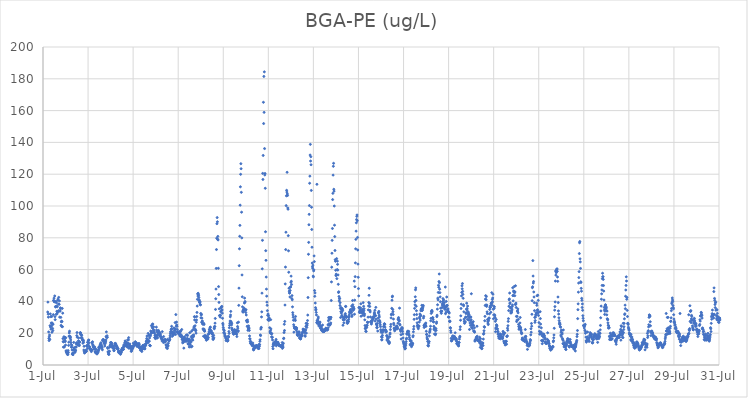
| Category | BGA-PE (ug/L) |
|---|---|
| 44378.208333333336 | 33.31 |
| 44378.21875 | 39.56 |
| 44378.229166666664 | 31.99 |
| 44378.239583333336 | 30.1 |
| 44378.25 | 20.78 |
| 44378.260416666664 | 16.72 |
| 44378.270833333336 | 15.37 |
| 44378.28125 | 17.83 |
| 44378.291666666664 | 18.87 |
| 44378.302083333336 | 16.12 |
| 44378.3125 | 24.76 |
| 44378.322916666664 | 32.16 |
| 44378.333333333336 | 23.87 |
| 44378.34375 | 30.43 |
| 44378.354166666664 | 22.55 |
| 44378.364583333336 | 26.43 |
| 44378.375 | 24.46 |
| 44378.385416666664 | 30.5 |
| 44378.395833333336 | 20.56 |
| 44378.40625 | 26.41 |
| 44378.416666666664 | 25.51 |
| 44378.427083333336 | 22.97 |
| 44378.4375 | 21.65 |
| 44378.447916666664 | 25.65 |
| 44378.458333333336 | 31.68 |
| 44378.46875 | 40.64 |
| 44378.479166666664 | 40.42 |
| 44378.489583333336 | 42.03 |
| 44378.5 | 39.78 |
| 44378.510416666664 | 39.86 |
| 44378.520833333336 | 43.42 |
| 44378.53125 | 30.41 |
| 44378.541666666664 | 28.54 |
| 44378.552083333336 | 36.74 |
| 44378.5625 | 36.49 |
| 44378.572916666664 | 39.96 |
| 44378.583333333336 | 31.83 |
| 44378.59375 | 39.16 |
| 44378.604166666664 | 36.99 |
| 44378.614583333336 | 33.79 |
| 44378.625 | 32.2 |
| 44378.635416666664 | 36.65 |
| 44378.645833333336 | 33.16 |
| 44378.65625 | 40.75 |
| 44378.666666666664 | 41.42 |
| 44378.677083333336 | 34.01 |
| 44378.6875 | 38.34 |
| 44378.697916666664 | 42.54 |
| 44378.708333333336 | 34.14 |
| 44378.71875 | 38.15 |
| 44378.729166666664 | 40.31 |
| 44378.739583333336 | 30.11 |
| 44378.75 | 33.81 |
| 44378.760416666664 | 34.07 |
| 44378.770833333336 | 35.94 |
| 44378.78125 | 35.5 |
| 44378.791666666664 | 29.96 |
| 44378.802083333336 | 24.92 |
| 44378.8125 | 27.16 |
| 44378.822916666664 | 27.53 |
| 44378.833333333336 | 24.17 |
| 44378.84375 | 27.28 |
| 44378.854166666664 | 35.59 |
| 44378.864583333336 | 24.11 |
| 44378.875 | 32.61 |
| 44378.885416666664 | 16.61 |
| 44378.895833333336 | 14.73 |
| 44378.90625 | 11.23 |
| 44378.916666666664 | 14.56 |
| 44378.927083333336 | 17.75 |
| 44378.9375 | 11.4 |
| 44378.947916666664 | 11.41 |
| 44378.958333333336 | 16.57 |
| 44378.96875 | 17.48 |
| 44378.979166666664 | 15.41 |
| 44378.989583333336 | 14.73 |
| 44379.0 | 12.54 |
| 44379.010416666664 | 17.13 |
| 44379.020833333336 | 8.84 |
| 44379.03125 | 8.8 |
| 44379.041666666664 | 7.96 |
| 44379.052083333336 | 7.7 |
| 44379.0625 | 8.77 |
| 44379.072916666664 | 7.37 |
| 44379.083333333336 | 6.65 |
| 44379.09375 | 7.17 |
| 44379.104166666664 | 6.57 |
| 44379.114583333336 | 9.09 |
| 44379.125 | 7.9 |
| 44379.135416666664 | 12.32 |
| 44379.145833333336 | 14.35 |
| 44379.15625 | 18.14 |
| 44379.166666666664 | 20.14 |
| 44379.177083333336 | 21.27 |
| 44379.1875 | 17.79 |
| 44379.197916666664 | 18.1 |
| 44379.208333333336 | 16.87 |
| 44379.21875 | 17.45 |
| 44379.229166666664 | 15.76 |
| 44379.239583333336 | 14.22 |
| 44379.25 | 12.93 |
| 44379.260416666664 | 11.3 |
| 44379.270833333336 | 11.16 |
| 44379.28125 | 12.42 |
| 44379.291666666664 | 9.45 |
| 44379.302083333336 | 6.78 |
| 44379.3125 | 7.08 |
| 44379.322916666664 | 7.58 |
| 44379.333333333336 | 6.47 |
| 44379.34375 | 7.42 |
| 44379.354166666664 | 9.43 |
| 44379.364583333336 | 14.2 |
| 44379.375 | 10.65 |
| 44379.385416666664 | 10.89 |
| 44379.395833333336 | 9.6 |
| 44379.40625 | 9.14 |
| 44379.416666666664 | 7.91 |
| 44379.427083333336 | 8.47 |
| 44379.4375 | 9.06 |
| 44379.447916666664 | 9.3 |
| 44379.458333333336 | 11.19 |
| 44379.46875 | 11.37 |
| 44379.479166666664 | 13.23 |
| 44379.489583333336 | 14.04 |
| 44379.5 | 18.48 |
| 44379.510416666664 | 20.41 |
| 44379.520833333336 | 17.46 |
| 44379.53125 | 13.71 |
| 44379.541666666664 | 13.32 |
| 44379.552083333336 | 12.68 |
| 44379.5625 | 12.41 |
| 44379.572916666664 | 15.25 |
| 44379.583333333336 | 17.06 |
| 44379.59375 | 14.6 |
| 44379.604166666664 | 12.84 |
| 44379.614583333336 | 12.23 |
| 44379.625 | 14.38 |
| 44379.635416666664 | 14.44 |
| 44379.645833333336 | 20.23 |
| 44379.65625 | 20.19 |
| 44379.666666666664 | 20.32 |
| 44379.677083333336 | 19.05 |
| 44379.6875 | 19.18 |
| 44379.697916666664 | 17.1 |
| 44379.708333333336 | 17.31 |
| 44379.71875 | 18.7 |
| 44379.729166666664 | 17.12 |
| 44379.739583333336 | 16.35 |
| 44379.75 | 15.94 |
| 44379.760416666664 | 15.46 |
| 44379.770833333336 | 13.69 |
| 44379.78125 | 15.69 |
| 44379.791666666664 | 15.46 |
| 44379.802083333336 | 14.37 |
| 44379.8125 | 9.44 |
| 44379.822916666664 | 11.75 |
| 44379.833333333336 | 8.46 |
| 44379.84375 | 7.49 |
| 44379.854166666664 | 8.1 |
| 44379.864583333336 | 8.16 |
| 44379.875 | 8.69 |
| 44379.885416666664 | 8.29 |
| 44379.895833333336 | 8.35 |
| 44379.90625 | 9.25 |
| 44379.916666666664 | 8.76 |
| 44379.927083333336 | 8.65 |
| 44379.9375 | 12.15 |
| 44379.947916666664 | 11.9 |
| 44379.958333333336 | 11.86 |
| 44379.96875 | 10.39 |
| 44379.979166666664 | 14.22 |
| 44379.989583333336 | 14.36 |
| 44380.0 | 12.8 |
| 44380.010416666664 | 15.24 |
| 44380.020833333336 | 15.49 |
| 44380.03125 | 15.75 |
| 44380.041666666664 | 13.92 |
| 44380.052083333336 | 11.72 |
| 44380.0625 | 10.47 |
| 44380.072916666664 | 11.26 |
| 44380.083333333336 | 10.14 |
| 44380.09375 | 10.38 |
| 44380.104166666664 | 9.75 |
| 44380.114583333336 | 9.85 |
| 44380.125 | 9.39 |
| 44380.135416666664 | 9.03 |
| 44380.145833333336 | 8.44 |
| 44380.15625 | 9.46 |
| 44380.166666666664 | 13.96 |
| 44380.177083333336 | 9.55 |
| 44380.1875 | 13.89 |
| 44380.197916666664 | 14.64 |
| 44380.208333333336 | 12.78 |
| 44380.21875 | 12.31 |
| 44380.229166666664 | 11.53 |
| 44380.239583333336 | 11.13 |
| 44380.25 | 11.29 |
| 44380.260416666664 | 9.96 |
| 44380.270833333336 | 11.26 |
| 44380.28125 | 10.85 |
| 44380.291666666664 | 11.39 |
| 44380.302083333336 | 10.02 |
| 44380.3125 | 8.28 |
| 44380.322916666664 | 8.46 |
| 44380.333333333336 | 7.66 |
| 44380.34375 | 7.98 |
| 44380.354166666664 | 9.95 |
| 44380.364583333336 | 8 |
| 44380.375 | 7.69 |
| 44380.385416666664 | 7.7 |
| 44380.395833333336 | 6.91 |
| 44380.40625 | 7.71 |
| 44380.416666666664 | 7.51 |
| 44380.427083333336 | 8.96 |
| 44380.4375 | 8.76 |
| 44380.447916666664 | 8.13 |
| 44380.458333333336 | 8.91 |
| 44380.46875 | 11.08 |
| 44380.479166666664 | 9.68 |
| 44380.489583333336 | 10.19 |
| 44380.5 | 11.33 |
| 44380.510416666664 | 11.13 |
| 44380.520833333336 | 11 |
| 44380.53125 | 12.35 |
| 44380.541666666664 | 13.06 |
| 44380.552083333336 | 12.88 |
| 44380.5625 | 12.35 |
| 44380.572916666664 | 14.03 |
| 44380.583333333336 | 12.76 |
| 44380.59375 | 10.98 |
| 44380.604166666664 | 11.9 |
| 44380.614583333336 | 10.61 |
| 44380.625 | 11.01 |
| 44380.635416666664 | 9.57 |
| 44380.645833333336 | 15.63 |
| 44380.65625 | 15.37 |
| 44380.666666666664 | 16 |
| 44380.677083333336 | 15.71 |
| 44380.6875 | 15.95 |
| 44380.697916666664 | 15.39 |
| 44380.708333333336 | 13.82 |
| 44380.71875 | 13.47 |
| 44380.729166666664 | 14.19 |
| 44380.739583333336 | 11.93 |
| 44380.75 | 14.69 |
| 44380.760416666664 | 13.37 |
| 44380.770833333336 | 14.19 |
| 44380.78125 | 14.97 |
| 44380.791666666664 | 15.77 |
| 44380.802083333336 | 17.92 |
| 44380.8125 | 20.83 |
| 44380.822916666664 | 17.36 |
| 44380.833333333336 | 17.69 |
| 44380.84375 | 18.38 |
| 44380.854166666664 | 17.36 |
| 44380.864583333336 | 10.98 |
| 44380.875 | 10.44 |
| 44380.885416666664 | 8.31 |
| 44380.895833333336 | 8.11 |
| 44380.90625 | 6.84 |
| 44380.916666666664 | 7.02 |
| 44380.927083333336 | 6.62 |
| 44380.9375 | 8.44 |
| 44380.947916666664 | 8.7 |
| 44380.958333333336 | 11.17 |
| 44380.96875 | 12.06 |
| 44380.979166666664 | 11.68 |
| 44380.989583333336 | 12.65 |
| 44381.0 | 14.14 |
| 44381.010416666664 | 13.85 |
| 44381.020833333336 | 13.09 |
| 44381.03125 | 13.78 |
| 44381.041666666664 | 14 |
| 44381.052083333336 | 13.01 |
| 44381.0625 | 12.33 |
| 44381.072916666664 | 11.16 |
| 44381.083333333336 | 11.4 |
| 44381.09375 | 11.69 |
| 44381.104166666664 | 11.56 |
| 44381.114583333336 | 10.4 |
| 44381.125 | 10.54 |
| 44381.135416666664 | 10.45 |
| 44381.145833333336 | 8.97 |
| 44381.15625 | 9.19 |
| 44381.166666666664 | 10.31 |
| 44381.177083333336 | 12.05 |
| 44381.1875 | 13.51 |
| 44381.197916666664 | 12.98 |
| 44381.208333333336 | 12.96 |
| 44381.21875 | 13.6 |
| 44381.229166666664 | 12.19 |
| 44381.239583333336 | 12.93 |
| 44381.25 | 11.51 |
| 44381.260416666664 | 11.85 |
| 44381.270833333336 | 10.41 |
| 44381.28125 | 11.74 |
| 44381.291666666664 | 11.14 |
| 44381.302083333336 | 10.34 |
| 44381.3125 | 10.43 |
| 44381.322916666664 | 9.98 |
| 44381.333333333336 | 10.21 |
| 44381.34375 | 8.76 |
| 44381.354166666664 | 8.18 |
| 44381.364583333336 | 7.73 |
| 44381.375 | 8.23 |
| 44381.385416666664 | 8.3 |
| 44381.395833333336 | 8.35 |
| 44381.40625 | 8.23 |
| 44381.416666666664 | 8.58 |
| 44381.427083333336 | 7.86 |
| 44381.4375 | 6.71 |
| 44381.447916666664 | 7.36 |
| 44381.458333333336 | 7.66 |
| 44381.46875 | 8.18 |
| 44381.479166666664 | 8.21 |
| 44381.489583333336 | 9.85 |
| 44381.5 | 9.84 |
| 44381.510416666664 | 9.36 |
| 44381.520833333336 | 9.98 |
| 44381.53125 | 10.78 |
| 44381.541666666664 | 10.82 |
| 44381.552083333336 | 9.72 |
| 44381.5625 | 9.98 |
| 44381.572916666664 | 9.89 |
| 44381.583333333336 | 12.54 |
| 44381.59375 | 12.01 |
| 44381.604166666664 | 11.8 |
| 44381.614583333336 | 11.97 |
| 44381.625 | 13.9 |
| 44381.635416666664 | 11.85 |
| 44381.645833333336 | 15.15 |
| 44381.65625 | 14.6 |
| 44381.666666666664 | 13.25 |
| 44381.677083333336 | 12.46 |
| 44381.6875 | 14.1 |
| 44381.697916666664 | 12.82 |
| 44381.708333333336 | 14.32 |
| 44381.71875 | 13.42 |
| 44381.729166666664 | 12.52 |
| 44381.739583333336 | 11.29 |
| 44381.75 | 11.57 |
| 44381.760416666664 | 15.85 |
| 44381.770833333336 | 13.7 |
| 44381.78125 | 13.38 |
| 44381.791666666664 | 15.79 |
| 44381.802083333336 | 17.22 |
| 44381.8125 | 10.53 |
| 44381.822916666664 | 11.7 |
| 44381.833333333336 | 12.76 |
| 44381.84375 | 11.84 |
| 44381.854166666664 | 13.25 |
| 44381.864583333336 | 11.48 |
| 44381.875 | 10.47 |
| 44381.885416666664 | 11.86 |
| 44381.895833333336 | 11.72 |
| 44381.90625 | 10.54 |
| 44381.916666666664 | 8.56 |
| 44381.927083333336 | 8.87 |
| 44381.9375 | 10.25 |
| 44381.947916666664 | 9.55 |
| 44381.958333333336 | 10.13 |
| 44381.96875 | 10.67 |
| 44381.979166666664 | 10.91 |
| 44381.989583333336 | 11.89 |
| 44382.0 | 10.83 |
| 44382.010416666664 | 13.75 |
| 44382.020833333336 | 12.02 |
| 44382.03125 | 12.49 |
| 44382.041666666664 | 12.47 |
| 44382.052083333336 | 12.8 |
| 44382.0625 | 12.42 |
| 44382.072916666664 | 12.92 |
| 44382.083333333336 | 13.44 |
| 44382.09375 | 14.63 |
| 44382.104166666664 | 14.31 |
| 44382.114583333336 | 12.99 |
| 44382.125 | 13.87 |
| 44382.135416666664 | 13.83 |
| 44382.145833333336 | 12.88 |
| 44382.15625 | 13.04 |
| 44382.166666666664 | 11.73 |
| 44382.177083333336 | 13.45 |
| 44382.1875 | 12.46 |
| 44382.197916666664 | 12.14 |
| 44382.208333333336 | 11.78 |
| 44382.21875 | 12.8 |
| 44382.229166666664 | 11.59 |
| 44382.239583333336 | 13.14 |
| 44382.25 | 12.42 |
| 44382.260416666664 | 13.59 |
| 44382.270833333336 | 12.77 |
| 44382.28125 | 10.78 |
| 44382.291666666664 | 10.82 |
| 44382.302083333336 | 10.68 |
| 44382.3125 | 10.52 |
| 44382.322916666664 | 9.31 |
| 44382.333333333336 | 11.33 |
| 44382.34375 | 10.98 |
| 44382.354166666664 | 10.83 |
| 44382.364583333336 | 10.62 |
| 44382.375 | 9.53 |
| 44382.385416666664 | 8.5 |
| 44382.395833333336 | 9.73 |
| 44382.40625 | 9.97 |
| 44382.416666666664 | 11.46 |
| 44382.427083333336 | 12.21 |
| 44382.4375 | 12.19 |
| 44382.447916666664 | 11.13 |
| 44382.458333333336 | 12.39 |
| 44382.46875 | 10.83 |
| 44382.479166666664 | 10.24 |
| 44382.489583333336 | 10.47 |
| 44382.5 | 10.76 |
| 44382.510416666664 | 10.29 |
| 44382.520833333336 | 10.14 |
| 44382.53125 | 11.8 |
| 44382.541666666664 | 12.5 |
| 44382.552083333336 | 13.33 |
| 44382.5625 | 12.53 |
| 44382.572916666664 | 13.46 |
| 44382.583333333336 | 14.96 |
| 44382.59375 | 14.85 |
| 44382.604166666664 | 16.68 |
| 44382.614583333336 | 18.21 |
| 44382.625 | 15.94 |
| 44382.635416666664 | 15.1 |
| 44382.645833333336 | 15.82 |
| 44382.65625 | 13.91 |
| 44382.666666666664 | 19.85 |
| 44382.677083333336 | 15.1 |
| 44382.6875 | 14.85 |
| 44382.697916666664 | 18.69 |
| 44382.708333333336 | 18.59 |
| 44382.71875 | 14.98 |
| 44382.729166666664 | 17.01 |
| 44382.739583333336 | 12.45 |
| 44382.75 | 12.17 |
| 44382.760416666664 | 12.11 |
| 44382.770833333336 | 18.36 |
| 44382.78125 | 21.34 |
| 44382.791666666664 | 19.68 |
| 44382.802083333336 | 20.81 |
| 44382.8125 | 24.77 |
| 44382.822916666664 | 20.49 |
| 44382.833333333336 | 20.35 |
| 44382.84375 | 23.84 |
| 44382.854166666664 | 25.63 |
| 44382.864583333336 | 23.12 |
| 44382.875 | 25.76 |
| 44382.885416666664 | 23.85 |
| 44382.895833333336 | 21.76 |
| 44382.90625 | 24.02 |
| 44382.916666666664 | 22.08 |
| 44382.927083333336 | 20.73 |
| 44382.9375 | 20.7 |
| 44382.947916666664 | 19.93 |
| 44382.958333333336 | 17.23 |
| 44382.96875 | 18.66 |
| 44382.979166666664 | 17.16 |
| 44382.989583333336 | 16.58 |
| 44383.0 | 18.44 |
| 44383.010416666664 | 18.06 |
| 44383.020833333336 | 18.4 |
| 44383.03125 | 23.84 |
| 44383.041666666664 | 21.95 |
| 44383.052083333336 | 16.93 |
| 44383.0625 | 20.88 |
| 44383.072916666664 | 18.88 |
| 44383.083333333336 | 17.09 |
| 44383.09375 | 18.55 |
| 44383.104166666664 | 20.15 |
| 44383.114583333336 | 19.97 |
| 44383.125 | 21.74 |
| 44383.135416666664 | 20.21 |
| 44383.145833333336 | 20.47 |
| 44383.15625 | 20.87 |
| 44383.166666666664 | 20.33 |
| 44383.177083333336 | 19.2 |
| 44383.1875 | 18.26 |
| 44383.197916666664 | 19.22 |
| 44383.208333333336 | 19.63 |
| 44383.21875 | 17.83 |
| 44383.229166666664 | 17.82 |
| 44383.239583333336 | 17.85 |
| 44383.25 | 16.56 |
| 44383.260416666664 | 16.67 |
| 44383.270833333336 | 17.06 |
| 44383.28125 | 15.15 |
| 44383.291666666664 | 20.98 |
| 44383.302083333336 | 16.02 |
| 44383.3125 | 15.8 |
| 44383.322916666664 | 15.77 |
| 44383.333333333336 | 15.55 |
| 44383.34375 | 14.15 |
| 44383.354166666664 | 17.89 |
| 44383.364583333336 | 15.46 |
| 44383.375 | 15.72 |
| 44383.385416666664 | 15.35 |
| 44383.395833333336 | 14.45 |
| 44383.40625 | 15.93 |
| 44383.416666666664 | 15.05 |
| 44383.427083333336 | 16.06 |
| 44383.4375 | 14.68 |
| 44383.447916666664 | 15.74 |
| 44383.458333333336 | 12.6 |
| 44383.46875 | 12.68 |
| 44383.479166666664 | 11.17 |
| 44383.489583333336 | 10.75 |
| 44383.5 | 12.13 |
| 44383.510416666664 | 11.34 |
| 44383.520833333336 | 10.38 |
| 44383.53125 | 16.17 |
| 44383.541666666664 | 12.38 |
| 44383.552083333336 | 11.95 |
| 44383.5625 | 13.71 |
| 44383.572916666664 | 15.39 |
| 44383.583333333336 | 15.53 |
| 44383.59375 | 15.2 |
| 44383.604166666664 | 15.34 |
| 44383.614583333336 | 15.81 |
| 44383.625 | 16.13 |
| 44383.635416666664 | 17.37 |
| 44383.645833333336 | 18.61 |
| 44383.65625 | 19.86 |
| 44383.666666666664 | 21.02 |
| 44383.677083333336 | 20.63 |
| 44383.6875 | 22.21 |
| 44383.697916666664 | 22.72 |
| 44383.708333333336 | 24.34 |
| 44383.71875 | 22.74 |
| 44383.729166666664 | 19.71 |
| 44383.739583333336 | 18.06 |
| 44383.75 | 20.78 |
| 44383.760416666664 | 20.32 |
| 44383.770833333336 | 19.18 |
| 44383.78125 | 18.87 |
| 44383.791666666664 | 20.1 |
| 44383.802083333336 | 19.22 |
| 44383.8125 | 23.34 |
| 44383.822916666664 | 20.13 |
| 44383.833333333336 | 21.67 |
| 44383.84375 | 22.67 |
| 44383.854166666664 | 22.05 |
| 44383.864583333336 | 26.67 |
| 44383.875 | 22.69 |
| 44383.885416666664 | 19.2 |
| 44383.895833333336 | 31.71 |
| 44383.90625 | 20.83 |
| 44383.916666666664 | 24.51 |
| 44383.927083333336 | 26.99 |
| 44383.9375 | 25.24 |
| 44383.947916666664 | 24.3 |
| 44383.958333333336 | 22.35 |
| 44383.96875 | 20.83 |
| 44383.979166666664 | 20.34 |
| 44383.989583333336 | 20.41 |
| 44384.0 | 20.22 |
| 44384.010416666664 | 19.86 |
| 44384.020833333336 | 19.72 |
| 44384.03125 | 20.2 |
| 44384.041666666664 | 21.05 |
| 44384.052083333336 | 20.48 |
| 44384.0625 | 20.34 |
| 44384.072916666664 | 18.42 |
| 44384.083333333336 | 18.25 |
| 44384.09375 | 19.18 |
| 44384.104166666664 | 21.08 |
| 44384.114583333336 | 21.44 |
| 44384.125 | 18.86 |
| 44384.135416666664 | 18.76 |
| 44384.145833333336 | 17.44 |
| 44384.15625 | 22.31 |
| 44384.166666666664 | 18.05 |
| 44384.177083333336 | 16.05 |
| 44384.1875 | 16.28 |
| 44384.197916666664 | 13.95 |
| 44384.208333333336 | 15.1 |
| 44384.21875 | 14.97 |
| 44384.229166666664 | 16.55 |
| 44384.239583333336 | 14.32 |
| 44384.25 | 10.62 |
| 44384.260416666664 | 15.84 |
| 44384.270833333336 | 17.69 |
| 44384.28125 | 17.38 |
| 44384.291666666664 | 15.74 |
| 44384.302083333336 | 16.04 |
| 44384.3125 | 15.57 |
| 44384.322916666664 | 14.92 |
| 44384.333333333336 | 15.46 |
| 44384.34375 | 15.3 |
| 44384.354166666664 | 18.77 |
| 44384.364583333336 | 16.44 |
| 44384.375 | 16.1 |
| 44384.385416666664 | 14.86 |
| 44384.395833333336 | 19 |
| 44384.40625 | 16.61 |
| 44384.416666666664 | 18.53 |
| 44384.427083333336 | 16.46 |
| 44384.4375 | 13.26 |
| 44384.447916666664 | 13.29 |
| 44384.458333333336 | 13.05 |
| 44384.46875 | 15.39 |
| 44384.479166666664 | 14.54 |
| 44384.489583333336 | 11.35 |
| 44384.5 | 16.21 |
| 44384.510416666664 | 20.28 |
| 44384.520833333336 | 13.18 |
| 44384.53125 | 12.74 |
| 44384.541666666664 | 15.01 |
| 44384.552083333336 | 14.88 |
| 44384.5625 | 14.34 |
| 44384.572916666664 | 11.35 |
| 44384.583333333336 | 17.89 |
| 44384.59375 | 21.27 |
| 44384.604166666664 | 17.23 |
| 44384.614583333336 | 11.73 |
| 44384.625 | 16.25 |
| 44384.635416666664 | 18.53 |
| 44384.645833333336 | 15.61 |
| 44384.65625 | 22.2 |
| 44384.666666666664 | 17.65 |
| 44384.677083333336 | 18.08 |
| 44384.6875 | 18.88 |
| 44384.697916666664 | 23.41 |
| 44384.708333333336 | 24.23 |
| 44384.71875 | 30.41 |
| 44384.729166666664 | 28.32 |
| 44384.739583333336 | 30.24 |
| 44384.75 | 24.7 |
| 44384.760416666664 | 22.48 |
| 44384.770833333336 | 21.56 |
| 44384.78125 | 21.74 |
| 44384.791666666664 | 20.03 |
| 44384.802083333336 | 26.92 |
| 44384.8125 | 28.34 |
| 44384.822916666664 | 30.5 |
| 44384.833333333336 | 33.07 |
| 44384.84375 | 37.06 |
| 44384.854166666664 | 41.29 |
| 44384.864583333336 | 44.73 |
| 44384.875 | 43.37 |
| 44384.885416666664 | 45.1 |
| 44384.895833333336 | 44.44 |
| 44384.90625 | 43.63 |
| 44384.916666666664 | 42.42 |
| 44384.927083333336 | 40.31 |
| 44384.9375 | 40.87 |
| 44384.947916666664 | 39.32 |
| 44384.958333333336 | 39.23 |
| 44384.96875 | 39.83 |
| 44384.979166666664 | 38.04 |
| 44384.989583333336 | 37.8 |
| 44385.0 | 32.39 |
| 44385.010416666664 | 29.69 |
| 44385.020833333336 | 31.41 |
| 44385.03125 | 31.87 |
| 44385.041666666664 | 26.79 |
| 44385.052083333336 | 29.49 |
| 44385.0625 | 27.43 |
| 44385.072916666664 | 27.67 |
| 44385.083333333336 | 25.83 |
| 44385.09375 | 25.76 |
| 44385.104166666664 | 22.76 |
| 44385.114583333336 | 22.2 |
| 44385.125 | 18.05 |
| 44385.135416666664 | 26.17 |
| 44385.145833333336 | 25.48 |
| 44385.15625 | 22.44 |
| 44385.166666666664 | 21.29 |
| 44385.177083333336 | 21.35 |
| 44385.1875 | 18.6 |
| 44385.197916666664 | 17.13 |
| 44385.208333333336 | 18.19 |
| 44385.21875 | 17.31 |
| 44385.229166666664 | 17.09 |
| 44385.239583333336 | 16.4 |
| 44385.25 | 15.56 |
| 44385.260416666664 | 17.39 |
| 44385.270833333336 | 18.32 |
| 44385.28125 | 16.43 |
| 44385.291666666664 | 17.2 |
| 44385.302083333336 | 17.08 |
| 44385.3125 | 16.23 |
| 44385.322916666664 | 16.94 |
| 44385.333333333336 | 17.36 |
| 44385.34375 | 19.26 |
| 44385.354166666664 | 19.54 |
| 44385.364583333336 | 20.06 |
| 44385.375 | 21.09 |
| 44385.385416666664 | 22.24 |
| 44385.395833333336 | 22.46 |
| 44385.40625 | 22.63 |
| 44385.416666666664 | 23.61 |
| 44385.427083333336 | 23.85 |
| 44385.4375 | 20.98 |
| 44385.447916666664 | 21.26 |
| 44385.458333333336 | 21.65 |
| 44385.46875 | 21.31 |
| 44385.479166666664 | 20.05 |
| 44385.489583333336 | 19.97 |
| 44385.5 | 19.54 |
| 44385.510416666664 | 19.44 |
| 44385.520833333336 | 20.16 |
| 44385.53125 | 17.82 |
| 44385.541666666664 | 16.42 |
| 44385.552083333336 | 16.06 |
| 44385.5625 | 16.67 |
| 44385.572916666664 | 18.66 |
| 44385.583333333336 | 17.07 |
| 44385.59375 | 23.24 |
| 44385.604166666664 | 22.8 |
| 44385.614583333336 | 24.25 |
| 44385.625 | 24.15 |
| 44385.635416666664 | 26.31 |
| 44385.645833333336 | 29.28 |
| 44385.65625 | 34.96 |
| 44385.666666666664 | 41.65 |
| 44385.677083333336 | 47.75 |
| 44385.6875 | 60.75 |
| 44385.697916666664 | 72.6 |
| 44385.708333333336 | 79.74 |
| 44385.71875 | 88.86 |
| 44385.729166666664 | 92.72 |
| 44385.739583333336 | 90.1 |
| 44385.75 | 79.07 |
| 44385.760416666664 | 80.88 |
| 44385.770833333336 | 78.66 |
| 44385.78125 | 60.84 |
| 44385.791666666664 | 49.3 |
| 44385.802083333336 | 44.32 |
| 44385.8125 | 39.36 |
| 44385.822916666664 | 35.33 |
| 44385.833333333336 | 31.02 |
| 44385.84375 | 31.21 |
| 44385.854166666664 | 31.24 |
| 44385.864583333336 | 30.16 |
| 44385.875 | 31.31 |
| 44385.885416666664 | 33.51 |
| 44385.895833333336 | 35.82 |
| 44385.90625 | 36.41 |
| 44385.916666666664 | 36.32 |
| 44385.927083333336 | 34.34 |
| 44385.9375 | 36.89 |
| 44385.947916666664 | 34.65 |
| 44385.958333333336 | 32.61 |
| 44385.96875 | 29.38 |
| 44385.979166666664 | 26.17 |
| 44385.989583333336 | 25.21 |
| 44386.0 | 23.66 |
| 44386.010416666664 | 22.44 |
| 44386.020833333336 | 20.27 |
| 44386.03125 | 21.96 |
| 44386.041666666664 | 21.51 |
| 44386.052083333336 | 19.98 |
| 44386.0625 | 19.6 |
| 44386.072916666664 | 18.57 |
| 44386.083333333336 | 17.88 |
| 44386.09375 | 17.96 |
| 44386.104166666664 | 17.84 |
| 44386.114583333336 | 16.58 |
| 44386.125 | 15.32 |
| 44386.135416666664 | 16.58 |
| 44386.145833333336 | 16.34 |
| 44386.15625 | 16.54 |
| 44386.166666666664 | 16.08 |
| 44386.177083333336 | 15.21 |
| 44386.1875 | 15.06 |
| 44386.197916666664 | 16.21 |
| 44386.208333333336 | 15.32 |
| 44386.21875 | 17.91 |
| 44386.229166666664 | 18.04 |
| 44386.239583333336 | 17.62 |
| 44386.25 | 21.06 |
| 44386.260416666664 | 19.86 |
| 44386.270833333336 | 23.44 |
| 44386.28125 | 24.9 |
| 44386.291666666664 | 26.27 |
| 44386.302083333336 | 27.66 |
| 44386.3125 | 30.31 |
| 44386.322916666664 | 31.43 |
| 44386.333333333336 | 33.71 |
| 44386.34375 | 27.34 |
| 44386.354166666664 | 26.68 |
| 44386.364583333336 | 25.2 |
| 44386.375 | 26.15 |
| 44386.385416666664 | 23.17 |
| 44386.395833333336 | 22.19 |
| 44386.40625 | 22.3 |
| 44386.416666666664 | 21.79 |
| 44386.427083333336 | 20.44 |
| 44386.4375 | 21.29 |
| 44386.447916666664 | 19.98 |
| 44386.458333333336 | 19.39 |
| 44386.46875 | 19.47 |
| 44386.479166666664 | 19.75 |
| 44386.489583333336 | 20.5 |
| 44386.5 | 22 |
| 44386.510416666664 | 22.18 |
| 44386.520833333336 | 20.7 |
| 44386.53125 | 21.26 |
| 44386.541666666664 | 19.88 |
| 44386.552083333336 | 20.37 |
| 44386.5625 | 20.17 |
| 44386.572916666664 | 19.71 |
| 44386.583333333336 | 21.78 |
| 44386.59375 | 19.38 |
| 44386.604166666664 | 17.92 |
| 44386.614583333336 | 21.62 |
| 44386.625 | 26.52 |
| 44386.635416666664 | 24.22 |
| 44386.645833333336 | 23.18 |
| 44386.65625 | 21.06 |
| 44386.666666666664 | 21.54 |
| 44386.677083333336 | 26.93 |
| 44386.6875 | 37.51 |
| 44386.697916666664 | 48.34 |
| 44386.708333333336 | 62.47 |
| 44386.71875 | 73.07 |
| 44386.729166666664 | 80.95 |
| 44386.739583333336 | 87.81 |
| 44386.75 | 100.52 |
| 44386.760416666664 | 112.07 |
| 44386.770833333336 | 119.94 |
| 44386.78125 | 126.6 |
| 44386.791666666664 | 123.45 |
| 44386.802083333336 | 108.6 |
| 44386.8125 | 96.11 |
| 44386.822916666664 | 79.95 |
| 44386.833333333336 | 56.63 |
| 44386.84375 | 42.87 |
| 44386.854166666664 | 36.58 |
| 44386.864583333336 | 33.48 |
| 44386.875 | 34.38 |
| 44386.885416666664 | 33.27 |
| 44386.895833333336 | 33.73 |
| 44386.90625 | 35.17 |
| 44386.916666666664 | 34.85 |
| 44386.927083333336 | 35.72 |
| 44386.9375 | 38.97 |
| 44386.947916666664 | 42.06 |
| 44386.958333333336 | 39.45 |
| 44386.96875 | 39.91 |
| 44386.979166666664 | 34.62 |
| 44386.989583333336 | 34.68 |
| 44387.0 | 33.03 |
| 44387.010416666664 | 34.79 |
| 44387.020833333336 | 31.46 |
| 44387.03125 | 27.9 |
| 44387.041666666664 | 27.98 |
| 44387.052083333336 | 27.09 |
| 44387.0625 | 24.38 |
| 44387.072916666664 | 28.32 |
| 44387.083333333336 | 27.17 |
| 44387.09375 | 21.81 |
| 44387.104166666664 | 23.58 |
| 44387.114583333336 | 22.76 |
| 44387.125 | 24.58 |
| 44387.135416666664 | 23.17 |
| 44387.145833333336 | 23.24 |
| 44387.15625 | 21.74 |
| 44387.166666666664 | 18.27 |
| 44387.177083333336 | 16.53 |
| 44387.1875 | 16.34 |
| 44387.197916666664 | 14.75 |
| 44387.208333333336 | 13.66 |
| 44387.21875 | 14.77 |
| 44387.229166666664 | 13.64 |
| 44387.239583333336 | 13.2 |
| 44387.25 | 13.39 |
| 44387.260416666664 | 13.2 |
| 44387.270833333336 | 12.91 |
| 44387.28125 | 12.15 |
| 44387.291666666664 | 12.54 |
| 44387.302083333336 | 12.76 |
| 44387.3125 | 13.82 |
| 44387.322916666664 | 12.45 |
| 44387.333333333336 | 10.02 |
| 44387.34375 | 9.46 |
| 44387.354166666664 | 9.76 |
| 44387.364583333336 | 10.69 |
| 44387.375 | 11.05 |
| 44387.385416666664 | 11.22 |
| 44387.395833333336 | 11.87 |
| 44387.40625 | 11.79 |
| 44387.416666666664 | 11.38 |
| 44387.427083333336 | 10.89 |
| 44387.4375 | 11.19 |
| 44387.447916666664 | 12.15 |
| 44387.458333333336 | 11.5 |
| 44387.46875 | 12.14 |
| 44387.479166666664 | 11.49 |
| 44387.489583333336 | 12.17 |
| 44387.5 | 12.02 |
| 44387.510416666664 | 11.85 |
| 44387.520833333336 | 11.71 |
| 44387.53125 | 11.57 |
| 44387.541666666664 | 11.26 |
| 44387.552083333336 | 10.39 |
| 44387.5625 | 10.43 |
| 44387.572916666664 | 10.73 |
| 44387.583333333336 | 10.38 |
| 44387.59375 | 13.08 |
| 44387.604166666664 | 11.73 |
| 44387.614583333336 | 12.77 |
| 44387.625 | 14.86 |
| 44387.635416666664 | 15.9 |
| 44387.645833333336 | 18.88 |
| 44387.65625 | 18.49 |
| 44387.666666666664 | 22.57 |
| 44387.677083333336 | 23.26 |
| 44387.6875 | 23.68 |
| 44387.697916666664 | 30.23 |
| 44387.708333333336 | 33.42 |
| 44387.71875 | 45.19 |
| 44387.729166666664 | 60.47 |
| 44387.739583333336 | 78.4 |
| 44387.75 | 120.51 |
| 44387.760416666664 | 116.7 |
| 44387.770833333336 | 131.79 |
| 44387.78125 | 165.22 |
| 44387.791666666664 | 151.86 |
| 44387.802083333336 | 181.49 |
| 44387.8125 | 158.9 |
| 44387.822916666664 | 184.36 |
| 44387.833333333336 | 136.11 |
| 44387.84375 | 119.52 |
| 44387.854166666664 | 120.44 |
| 44387.864583333336 | 111.14 |
| 44387.875 | 83.8 |
| 44387.885416666664 | 71.9 |
| 44387.895833333336 | 65.84 |
| 44387.90625 | 55.31 |
| 44387.916666666664 | 47.72 |
| 44387.927083333336 | 43.31 |
| 44387.9375 | 39.55 |
| 44387.947916666664 | 37.54 |
| 44387.958333333336 | 34.19 |
| 44387.96875 | 31.23 |
| 44387.979166666664 | 28.46 |
| 44387.989583333336 | 32.08 |
| 44388.0 | 28.67 |
| 44388.010416666664 | 31.1 |
| 44388.020833333336 | 28.04 |
| 44388.03125 | 29.75 |
| 44388.041666666664 | 28.43 |
| 44388.052083333336 | 28.75 |
| 44388.0625 | 23.43 |
| 44388.072916666664 | 20.79 |
| 44388.083333333336 | 20.1 |
| 44388.09375 | 21.54 |
| 44388.104166666664 | 28.51 |
| 44388.114583333336 | 22.68 |
| 44388.125 | 19.97 |
| 44388.135416666664 | 19.65 |
| 44388.145833333336 | 17.76 |
| 44388.15625 | 19.73 |
| 44388.166666666664 | 17.34 |
| 44388.177083333336 | 17.5 |
| 44388.1875 | 15.75 |
| 44388.197916666664 | 11.66 |
| 44388.208333333336 | 10.24 |
| 44388.21875 | 13.04 |
| 44388.229166666664 | 13.75 |
| 44388.239583333336 | 12.96 |
| 44388.25 | 12.52 |
| 44388.260416666664 | 13.81 |
| 44388.270833333336 | 13.39 |
| 44388.28125 | 14.48 |
| 44388.291666666664 | 14.22 |
| 44388.302083333336 | 13.74 |
| 44388.3125 | 14.5 |
| 44388.322916666664 | 14.7 |
| 44388.333333333336 | 14.79 |
| 44388.34375 | 16.08 |
| 44388.354166666664 | 12.09 |
| 44388.364583333336 | 12.65 |
| 44388.375 | 14.54 |
| 44388.385416666664 | 13.26 |
| 44388.395833333336 | 13.04 |
| 44388.40625 | 12.96 |
| 44388.416666666664 | 13.9 |
| 44388.427083333336 | 14.31 |
| 44388.4375 | 13.7 |
| 44388.447916666664 | 13.21 |
| 44388.458333333336 | 12.81 |
| 44388.46875 | 12.64 |
| 44388.479166666664 | 12.13 |
| 44388.489583333336 | 12.47 |
| 44388.5 | 12.3 |
| 44388.510416666664 | 12.27 |
| 44388.520833333336 | 11.97 |
| 44388.53125 | 11.97 |
| 44388.541666666664 | 11.81 |
| 44388.552083333336 | 11.85 |
| 44388.5625 | 12.23 |
| 44388.572916666664 | 11.73 |
| 44388.583333333336 | 11.73 |
| 44388.59375 | 12.25 |
| 44388.604166666664 | 11.78 |
| 44388.614583333336 | 14.1 |
| 44388.625 | 10.45 |
| 44388.635416666664 | 11.51 |
| 44388.645833333336 | 12.58 |
| 44388.65625 | 11.21 |
| 44388.666666666664 | 13.68 |
| 44388.677083333336 | 16.59 |
| 44388.6875 | 16.88 |
| 44388.697916666664 | 20.41 |
| 44388.708333333336 | 25.61 |
| 44388.71875 | 21.7 |
| 44388.729166666664 | 27.4 |
| 44388.739583333336 | 37.71 |
| 44388.75 | 50.99 |
| 44388.760416666664 | 61.59 |
| 44388.770833333336 | 72.59 |
| 44388.78125 | 83.52 |
| 44388.791666666664 | 100.25 |
| 44388.802083333336 | 106.4 |
| 44388.8125 | 109.87 |
| 44388.822916666664 | 108.77 |
| 44388.833333333336 | 121.2 |
| 44388.84375 | 107.59 |
| 44388.854166666664 | 106.62 |
| 44388.864583333336 | 98.8 |
| 44388.875 | 97.99 |
| 44388.885416666664 | 81.34 |
| 44388.895833333336 | 71.81 |
| 44388.90625 | 58.34 |
| 44388.916666666664 | 48.29 |
| 44388.927083333336 | 46.45 |
| 44388.9375 | 45.26 |
| 44388.947916666664 | 45.32 |
| 44388.958333333336 | 42.79 |
| 44388.96875 | 46.86 |
| 44388.979166666664 | 49.19 |
| 44388.989583333336 | 49.02 |
| 44389.0 | 52.02 |
| 44389.010416666664 | 55.89 |
| 44389.020833333336 | 52.65 |
| 44389.03125 | 50.63 |
| 44389.041666666664 | 41.79 |
| 44389.052083333336 | 43.64 |
| 44389.0625 | 41 |
| 44389.072916666664 | 36.57 |
| 44389.083333333336 | 32.92 |
| 44389.09375 | 31.51 |
| 44389.104166666664 | 30.03 |
| 44389.114583333336 | 28.16 |
| 44389.125 | 25.31 |
| 44389.135416666664 | 20.65 |
| 44389.145833333336 | 24.16 |
| 44389.15625 | 23.26 |
| 44389.166666666664 | 23 |
| 44389.177083333336 | 23.66 |
| 44389.1875 | 28.87 |
| 44389.197916666664 | 27.98 |
| 44389.208333333336 | 30.53 |
| 44389.21875 | 23.43 |
| 44389.229166666664 | 23.47 |
| 44389.239583333336 | 21.94 |
| 44389.25 | 23.4 |
| 44389.260416666664 | 22.65 |
| 44389.270833333336 | 20.82 |
| 44389.28125 | 19.4 |
| 44389.291666666664 | 18.84 |
| 44389.302083333336 | 18.94 |
| 44389.3125 | 18.49 |
| 44389.322916666664 | 19.15 |
| 44389.333333333336 | 20.34 |
| 44389.34375 | 19.98 |
| 44389.354166666664 | 20.73 |
| 44389.364583333336 | 20.86 |
| 44389.375 | 20.25 |
| 44389.385416666664 | 16.85 |
| 44389.395833333336 | 17.41 |
| 44389.40625 | 19.04 |
| 44389.416666666664 | 17.05 |
| 44389.427083333336 | 16.41 |
| 44389.4375 | 16.46 |
| 44389.447916666664 | 18.3 |
| 44389.458333333336 | 18.66 |
| 44389.46875 | 18.12 |
| 44389.479166666664 | 18.2 |
| 44389.489583333336 | 19.31 |
| 44389.5 | 18.3 |
| 44389.510416666664 | 20.06 |
| 44389.520833333336 | 20.5 |
| 44389.53125 | 21.06 |
| 44389.541666666664 | 22.62 |
| 44389.552083333336 | 22.16 |
| 44389.5625 | 21.46 |
| 44389.572916666664 | 22.24 |
| 44389.583333333336 | 21.73 |
| 44389.59375 | 22.12 |
| 44389.604166666664 | 21.13 |
| 44389.614583333336 | 20.4 |
| 44389.625 | 18.54 |
| 44389.635416666664 | 18.04 |
| 44389.645833333336 | 21.66 |
| 44389.65625 | 22.23 |
| 44389.666666666664 | 24.3 |
| 44389.677083333336 | 26.22 |
| 44389.6875 | 20.07 |
| 44389.697916666664 | 26.01 |
| 44389.708333333336 | 23.64 |
| 44389.71875 | 25 |
| 44389.729166666664 | 25.98 |
| 44389.739583333336 | 27.96 |
| 44389.75 | 31.4 |
| 44389.760416666664 | 42.46 |
| 44389.770833333336 | 54.91 |
| 44389.78125 | 69.63 |
| 44389.791666666664 | 77.11 |
| 44389.802083333336 | 88.21 |
| 44389.8125 | 94.75 |
| 44389.822916666664 | 100.27 |
| 44389.833333333336 | 114.3 |
| 44389.84375 | 118.78 |
| 44389.854166666664 | 132.06 |
| 44389.864583333336 | 138.77 |
| 44389.875 | 128.28 |
| 44389.885416666664 | 131 |
| 44389.895833333336 | 125.94 |
| 44389.90625 | 109.79 |
| 44389.916666666664 | 99.22 |
| 44389.927083333336 | 85.23 |
| 44389.9375 | 74.08 |
| 44389.947916666664 | 64.13 |
| 44389.958333333336 | 61.8 |
| 44389.96875 | 60.85 |
| 44389.979166666664 | 62.8 |
| 44389.989583333336 | 55.93 |
| 44390.0 | 55.43 |
| 44390.010416666664 | 59.19 |
| 44390.020833333336 | 59.83 |
| 44390.03125 | 68.6 |
| 44390.041666666664 | 65.03 |
| 44390.052083333336 | 46.82 |
| 44390.0625 | 43.19 |
| 44390.072916666664 | 45.32 |
| 44390.083333333336 | 38.96 |
| 44390.09375 | 36.09 |
| 44390.104166666664 | 34.55 |
| 44390.114583333336 | 35 |
| 44390.125 | 33.08 |
| 44390.135416666664 | 31.47 |
| 44390.145833333336 | 26.76 |
| 44390.15625 | 113.64 |
| 44390.166666666664 | 27.89 |
| 44390.177083333336 | 26.1 |
| 44390.1875 | 28.24 |
| 44390.197916666664 | 27.31 |
| 44390.208333333336 | 29.12 |
| 44390.21875 | 30.15 |
| 44390.229166666664 | 26.19 |
| 44390.239583333336 | 24.6 |
| 44390.25 | 26.58 |
| 44390.260416666664 | 26.04 |
| 44390.270833333336 | 25.26 |
| 44390.28125 | 26.6 |
| 44390.291666666664 | 27.03 |
| 44390.302083333336 | 24.66 |
| 44390.3125 | 23.49 |
| 44390.322916666664 | 23.01 |
| 44390.333333333336 | 22.9 |
| 44390.34375 | 24.17 |
| 44390.354166666664 | 23.72 |
| 44390.364583333336 | 21.88 |
| 44390.375 | 21.67 |
| 44390.385416666664 | 22.19 |
| 44390.395833333336 | 21.89 |
| 44390.40625 | 25.12 |
| 44390.416666666664 | 22.29 |
| 44390.427083333336 | 20.87 |
| 44390.4375 | 21.41 |
| 44390.447916666664 | 21.96 |
| 44390.458333333336 | 21.08 |
| 44390.46875 | 21.09 |
| 44390.479166666664 | 21.31 |
| 44390.489583333336 | 21.38 |
| 44390.5 | 21.49 |
| 44390.510416666664 | 21.52 |
| 44390.520833333336 | 21.83 |
| 44390.53125 | 22.5 |
| 44390.541666666664 | 22.6 |
| 44390.552083333336 | 23.19 |
| 44390.5625 | 22.67 |
| 44390.572916666664 | 22.66 |
| 44390.583333333336 | 21.98 |
| 44390.59375 | 22.41 |
| 44390.604166666664 | 22.35 |
| 44390.614583333336 | 22.1 |
| 44390.625 | 22.11 |
| 44390.635416666664 | 22.44 |
| 44390.645833333336 | 25.23 |
| 44390.65625 | 23.42 |
| 44390.666666666664 | 27.8 |
| 44390.677083333336 | 29.85 |
| 44390.6875 | 25.88 |
| 44390.697916666664 | 28.72 |
| 44390.708333333336 | 29.34 |
| 44390.71875 | 24.94 |
| 44390.729166666664 | 29.94 |
| 44390.739583333336 | 25.35 |
| 44390.75 | 25.7 |
| 44390.760416666664 | 28.96 |
| 44390.770833333336 | 26.46 |
| 44390.78125 | 30 |
| 44390.791666666664 | 40.58 |
| 44390.802083333336 | 52.26 |
| 44390.8125 | 61.52 |
| 44390.822916666664 | 70.29 |
| 44390.833333333336 | 78.38 |
| 44390.84375 | 85.86 |
| 44390.854166666664 | 104.05 |
| 44390.864583333336 | 107.97 |
| 44390.875 | 119.43 |
| 44390.885416666664 | 124.97 |
| 44390.895833333336 | 126.84 |
| 44390.90625 | 110.52 |
| 44390.916666666664 | 109.34 |
| 44390.927083333336 | 99.99 |
| 44390.9375 | 87.93 |
| 44390.947916666664 | 80.76 |
| 44390.958333333336 | 72.02 |
| 44390.96875 | 66.26 |
| 44390.979166666664 | 65.24 |
| 44390.989583333336 | 59.59 |
| 44391.0 | 56.24 |
| 44391.010416666664 | 57.11 |
| 44391.020833333336 | 56.59 |
| 44391.03125 | 66.91 |
| 44391.041666666664 | 54.33 |
| 44391.052083333336 | 59.99 |
| 44391.0625 | 65.31 |
| 44391.072916666664 | 63.3 |
| 44391.083333333336 | 59.7 |
| 44391.09375 | 56.65 |
| 44391.104166666664 | 50.74 |
| 44391.114583333336 | 45.59 |
| 44391.125 | 46.04 |
| 44391.135416666664 | 43.08 |
| 44391.145833333336 | 40.35 |
| 44391.15625 | 41.66 |
| 44391.166666666664 | 41.93 |
| 44391.177083333336 | 37.42 |
| 44391.1875 | 39.17 |
| 44391.197916666664 | 35.58 |
| 44391.208333333336 | 29.87 |
| 44391.21875 | 33.55 |
| 44391.229166666664 | 36.12 |
| 44391.239583333336 | 32.61 |
| 44391.25 | 34.97 |
| 44391.260416666664 | 31.22 |
| 44391.270833333336 | 33.58 |
| 44391.28125 | 35.48 |
| 44391.291666666664 | 30.23 |
| 44391.302083333336 | 34.51 |
| 44391.3125 | 25 |
| 44391.322916666664 | 28.51 |
| 44391.333333333336 | 28.44 |
| 44391.34375 | 29.61 |
| 44391.354166666664 | 26.57 |
| 44391.364583333336 | 28.88 |
| 44391.375 | 28.63 |
| 44391.385416666664 | 30.03 |
| 44391.395833333336 | 31.45 |
| 44391.40625 | 30.65 |
| 44391.416666666664 | 32.32 |
| 44391.427083333336 | 36.85 |
| 44391.4375 | 36.83 |
| 44391.447916666664 | 30.95 |
| 44391.458333333336 | 29.93 |
| 44391.46875 | 30.1 |
| 44391.479166666664 | 30.25 |
| 44391.489583333336 | 27.79 |
| 44391.5 | 26.26 |
| 44391.510416666664 | 26.8 |
| 44391.520833333336 | 26.31 |
| 44391.53125 | 26.99 |
| 44391.541666666664 | 27.31 |
| 44391.552083333336 | 27.23 |
| 44391.5625 | 28.51 |
| 44391.572916666664 | 29.83 |
| 44391.583333333336 | 30.45 |
| 44391.59375 | 31.46 |
| 44391.604166666664 | 33.36 |
| 44391.614583333336 | 32.59 |
| 44391.625 | 33.15 |
| 44391.635416666664 | 34.52 |
| 44391.645833333336 | 34.86 |
| 44391.65625 | 33.65 |
| 44391.666666666664 | 33.61 |
| 44391.677083333336 | 33.47 |
| 44391.6875 | 32.96 |
| 44391.697916666664 | 37.06 |
| 44391.708333333336 | 30.52 |
| 44391.71875 | 31.35 |
| 44391.729166666664 | 35.62 |
| 44391.739583333336 | 40.57 |
| 44391.75 | 37.89 |
| 44391.760416666664 | 34.99 |
| 44391.770833333336 | 34.4 |
| 44391.78125 | 36.44 |
| 44391.791666666664 | 35.17 |
| 44391.802083333336 | 35.36 |
| 44391.8125 | 52.77 |
| 44391.822916666664 | 31.94 |
| 44391.833333333336 | 40.77 |
| 44391.84375 | 49.25 |
| 44391.854166666664 | 55.57 |
| 44391.864583333336 | 64.21 |
| 44391.875 | 73.06 |
| 44391.885416666664 | 79.03 |
| 44391.895833333336 | 84.19 |
| 44391.90625 | 89.44 |
| 44391.916666666664 | 91.5 |
| 44391.927083333336 | 93.45 |
| 44391.9375 | 94.36 |
| 44391.947916666664 | 90.76 |
| 44391.958333333336 | 80.24 |
| 44391.96875 | 72.34 |
| 44391.979166666664 | 63.46 |
| 44391.989583333336 | 55.16 |
| 44392.0 | 48.05 |
| 44392.010416666664 | 43.45 |
| 44392.020833333336 | 35.95 |
| 44392.03125 | 36.27 |
| 44392.041666666664 | 33.05 |
| 44392.052083333336 | 33.83 |
| 44392.0625 | 33.75 |
| 44392.072916666664 | 32.95 |
| 44392.083333333336 | 34.76 |
| 44392.09375 | 35.96 |
| 44392.104166666664 | 38.47 |
| 44392.114583333336 | 30.67 |
| 44392.125 | 33.46 |
| 44392.135416666664 | 33.48 |
| 44392.145833333336 | 33.44 |
| 44392.15625 | 33.26 |
| 44392.166666666664 | 32.83 |
| 44392.177083333336 | 35.04 |
| 44392.1875 | 31.36 |
| 44392.197916666664 | 33.92 |
| 44392.208333333336 | 39.22 |
| 44392.21875 | 32.83 |
| 44392.229166666664 | 36.93 |
| 44392.239583333336 | 34.15 |
| 44392.25 | 35.38 |
| 44392.260416666664 | 31 |
| 44392.270833333336 | 32.09 |
| 44392.28125 | 28.4 |
| 44392.291666666664 | 24.79 |
| 44392.302083333336 | 23.04 |
| 44392.3125 | 22.78 |
| 44392.322916666664 | 21.22 |
| 44392.333333333336 | 23.53 |
| 44392.34375 | 21.11 |
| 44392.354166666664 | 24.45 |
| 44392.364583333336 | 23.58 |
| 44392.375 | 24.79 |
| 44392.385416666664 | 25.08 |
| 44392.395833333336 | 26.91 |
| 44392.40625 | 26.78 |
| 44392.416666666664 | 26.8 |
| 44392.427083333336 | 30.1 |
| 44392.4375 | 34.65 |
| 44392.447916666664 | 37.14 |
| 44392.458333333336 | 39.32 |
| 44392.46875 | 43.83 |
| 44392.479166666664 | 48.26 |
| 44392.489583333336 | 38.67 |
| 44392.5 | 36.81 |
| 44392.510416666664 | 34.37 |
| 44392.520833333336 | 33.38 |
| 44392.53125 | 30.21 |
| 44392.541666666664 | 27.22 |
| 44392.552083333336 | 27.31 |
| 44392.5625 | 26.78 |
| 44392.572916666664 | 25.72 |
| 44392.583333333336 | 26.51 |
| 44392.59375 | 27.6 |
| 44392.604166666664 | 27.68 |
| 44392.614583333336 | 28.44 |
| 44392.625 | 29.44 |
| 44392.635416666664 | 30.05 |
| 44392.645833333336 | 28.68 |
| 44392.65625 | 29.49 |
| 44392.666666666664 | 29.85 |
| 44392.677083333336 | 29.97 |
| 44392.6875 | 30.66 |
| 44392.697916666664 | 32.08 |
| 44392.708333333336 | 33.09 |
| 44392.71875 | 32.16 |
| 44392.729166666664 | 34.42 |
| 44392.739583333336 | 27.62 |
| 44392.75 | 31.12 |
| 44392.760416666664 | 31.02 |
| 44392.770833333336 | 36.24 |
| 44392.78125 | 28.9 |
| 44392.791666666664 | 25.79 |
| 44392.802083333336 | 25.56 |
| 44392.8125 | 23.44 |
| 44392.822916666664 | 24.66 |
| 44392.833333333336 | 23.63 |
| 44392.84375 | 26.14 |
| 44392.854166666664 | 21.36 |
| 44392.864583333336 | 27.83 |
| 44392.875 | 29.52 |
| 44392.885416666664 | 32.75 |
| 44392.895833333336 | 33.15 |
| 44392.90625 | 33.74 |
| 44392.916666666664 | 31.37 |
| 44392.927083333336 | 30.2 |
| 44392.9375 | 27.99 |
| 44392.947916666664 | 27.24 |
| 44392.958333333336 | 26.58 |
| 44392.96875 | 25.25 |
| 44392.979166666664 | 24.1 |
| 44392.989583333336 | 22.23 |
| 44393.0 | 21.4 |
| 44393.010416666664 | 20.51 |
| 44393.020833333336 | 17.71 |
| 44393.03125 | 15.87 |
| 44393.041666666664 | 15.8 |
| 44393.052083333336 | 17.5 |
| 44393.0625 | 18.65 |
| 44393.072916666664 | 20.5 |
| 44393.083333333336 | 22.09 |
| 44393.09375 | 22.01 |
| 44393.104166666664 | 21.9 |
| 44393.114583333336 | 24.09 |
| 44393.125 | 21.73 |
| 44393.135416666664 | 25.13 |
| 44393.145833333336 | 25.84 |
| 44393.15625 | 25.93 |
| 44393.166666666664 | 25.55 |
| 44393.177083333336 | 23.85 |
| 44393.1875 | 22.02 |
| 44393.197916666664 | 22.18 |
| 44393.208333333336 | 21.43 |
| 44393.21875 | 20.65 |
| 44393.229166666664 | 21.41 |
| 44393.239583333336 | 21.05 |
| 44393.25 | 18.5 |
| 44393.260416666664 | 15.72 |
| 44393.270833333336 | 18.06 |
| 44393.28125 | 18.21 |
| 44393.291666666664 | 17.54 |
| 44393.302083333336 | 16.66 |
| 44393.3125 | 16.46 |
| 44393.322916666664 | 14.73 |
| 44393.333333333336 | 14.52 |
| 44393.34375 | 13.95 |
| 44393.354166666664 | 14.76 |
| 44393.364583333336 | 13.53 |
| 44393.375 | 14.23 |
| 44393.385416666664 | 17.74 |
| 44393.395833333336 | 19.34 |
| 44393.40625 | 20.11 |
| 44393.416666666664 | 22.28 |
| 44393.427083333336 | 24.13 |
| 44393.4375 | 25.55 |
| 44393.447916666664 | 29.61 |
| 44393.458333333336 | 31.6 |
| 44393.46875 | 32.04 |
| 44393.479166666664 | 35.65 |
| 44393.489583333336 | 40.74 |
| 44393.5 | 42.83 |
| 44393.510416666664 | 43.31 |
| 44393.520833333336 | 34.93 |
| 44393.53125 | 33.53 |
| 44393.541666666664 | 31.77 |
| 44393.552083333336 | 28.9 |
| 44393.5625 | 26.25 |
| 44393.572916666664 | 25.24 |
| 44393.583333333336 | 23.14 |
| 44393.59375 | 22.87 |
| 44393.604166666664 | 21.51 |
| 44393.614583333336 | 22.05 |
| 44393.625 | 22.34 |
| 44393.635416666664 | 22.28 |
| 44393.645833333336 | 22.39 |
| 44393.65625 | 22.83 |
| 44393.666666666664 | 23.76 |
| 44393.677083333336 | 24.18 |
| 44393.6875 | 23.87 |
| 44393.697916666664 | 24.45 |
| 44393.708333333336 | 24.25 |
| 44393.71875 | 23.87 |
| 44393.729166666664 | 22.79 |
| 44393.739583333336 | 23.17 |
| 44393.75 | 26.29 |
| 44393.760416666664 | 28.57 |
| 44393.770833333336 | 29.16 |
| 44393.78125 | 29.84 |
| 44393.791666666664 | 28.49 |
| 44393.802083333336 | 28 |
| 44393.8125 | 27.63 |
| 44393.822916666664 | 35.78 |
| 44393.83347222222 | 25.6 |
| 44393.84375 | 25.13 |
| 44393.854166666664 | 22.17 |
| 44393.864583333336 | 22.23 |
| 44393.875 | 21.13 |
| 44393.885416666664 | 19.03 |
| 44393.895833333336 | 16.37 |
| 44393.90625 | 22.14 |
| 44393.916666666664 | 22.76 |
| 44393.927083333336 | 23.49 |
| 44393.9375 | 23.4 |
| 44393.947916666664 | 22.75 |
| 44393.958333333336 | 21.11 |
| 44393.96875 | 19.53 |
| 44393.979166666664 | 17.04 |
| 44393.989583333336 | 14.85 |
| 44394.0 | 14.2 |
| 44394.010416666664 | 13.6 |
| 44394.020833333336 | 12.76 |
| 44394.03125 | 11.53 |
| 44394.041666666664 | 11.45 |
| 44394.052083333336 | 11.13 |
| 44394.0625 | 10.07 |
| 44394.072916666664 | 10.45 |
| 44394.083333333336 | 10.53 |
| 44394.09375 | 12.15 |
| 44394.104166666664 | 13.34 |
| 44394.114583333336 | 14.68 |
| 44394.125 | 16.28 |
| 44394.135416666664 | 16.87 |
| 44394.145833333336 | 19.55 |
| 44394.15625 | 19.34 |
| 44394.166666666664 | 20.02 |
| 44394.177083333336 | 21.04 |
| 44394.1875 | 21.28 |
| 44394.197916666664 | 21.02 |
| 44394.208333333336 | 19.81 |
| 44394.21875 | 20.14 |
| 44394.229166666664 | 21.19 |
| 44394.239583333336 | 19.05 |
| 44394.25 | 18.53 |
| 44394.260416666664 | 17.34 |
| 44394.270833333336 | 16.17 |
| 44394.28125 | 15.96 |
| 44394.291666666664 | 12.65 |
| 44394.302083333336 | 15.16 |
| 44394.3125 | 15.01 |
| 44394.322916666664 | 13.27 |
| 44394.333333333336 | 13.25 |
| 44394.34375 | 15.11 |
| 44394.354166666664 | 11.51 |
| 44394.364583333336 | 12.95 |
| 44394.375 | 13.79 |
| 44394.385416666664 | 12.42 |
| 44394.395833333336 | 13.16 |
| 44394.40625 | 13.66 |
| 44394.416666666664 | 17.74 |
| 44394.427083333336 | 18.46 |
| 44394.4375 | 20.86 |
| 44394.447916666664 | 22.58 |
| 44394.458333333336 | 24.24 |
| 44394.46875 | 28.73 |
| 44394.479166666664 | 31.63 |
| 44394.489583333336 | 35.62 |
| 44394.5 | 39.85 |
| 44394.510416666664 | 37.84 |
| 44394.520833333336 | 42.89 |
| 44394.53125 | 47.28 |
| 44394.541666666664 | 48.49 |
| 44394.552083333336 | 40.62 |
| 44394.5625 | 36.94 |
| 44394.572916666664 | 34.13 |
| 44394.583333333336 | 31.73 |
| 44394.59375 | 29.19 |
| 44394.604166666664 | 26.55 |
| 44394.614583333336 | 24.69 |
| 44394.625 | 25.08 |
| 44394.635416666664 | 23.86 |
| 44394.645833333336 | 23.85 |
| 44394.65625 | 22.81 |
| 44394.666666666664 | 24.18 |
| 44394.677083333336 | 24.64 |
| 44394.6875 | 24.43 |
| 44394.697916666664 | 26.97 |
| 44394.708333333336 | 30.04 |
| 44394.71875 | 29.21 |
| 44394.729166666664 | 32.06 |
| 44394.739583333336 | 28.26 |
| 44394.75 | 30.73 |
| 44394.760416666664 | 31.3 |
| 44394.770833333336 | 34.13 |
| 44394.78125 | 35 |
| 44394.791666666664 | 35.34 |
| 44394.802083333336 | 35.54 |
| 44394.8125 | 37.55 |
| 44394.822916666664 | 34.25 |
| 44394.833333333336 | 34.38 |
| 44394.84375 | 35.25 |
| 44394.854166666664 | 36.01 |
| 44394.864583333336 | 36.9 |
| 44394.875 | 37.47 |
| 44394.885416666664 | 29.56 |
| 44394.895833333336 | 30.61 |
| 44394.90625 | 24.85 |
| 44394.916666666664 | 23.61 |
| 44394.927083333336 | 24.33 |
| 44394.9375 | 25.49 |
| 44394.947916666664 | 24.22 |
| 44394.958333333336 | 25.75 |
| 44394.96875 | 25.85 |
| 44394.979166666664 | 24.61 |
| 44394.989583333336 | 26.4 |
| 44395.0 | 24.37 |
| 44395.010416666664 | 21.21 |
| 44395.020833333336 | 19.17 |
| 44395.03125 | 19.24 |
| 44395.041666666664 | 17.55 |
| 44395.052083333336 | 16.52 |
| 44395.0625 | 16.11 |
| 44395.072916666664 | 14.76 |
| 44395.083333333336 | 12.26 |
| 44395.09375 | 12.06 |
| 44395.104166666664 | 11.99 |
| 44395.114583333336 | 13.52 |
| 44395.125 | 14.51 |
| 44395.135416666664 | 14.76 |
| 44395.145833333336 | 18.31 |
| 44395.15625 | 20.47 |
| 44395.166666666664 | 21.26 |
| 44395.177083333336 | 21.97 |
| 44395.1875 | 22.59 |
| 44395.197916666664 | 24.4 |
| 44395.208333333336 | 27.79 |
| 44395.21875 | 29.34 |
| 44395.229166666664 | 32.46 |
| 44395.239583333336 | 33.85 |
| 44395.25 | 33.61 |
| 44395.260416666664 | 34.33 |
| 44395.270833333336 | 33.43 |
| 44395.28125 | 29.6 |
| 44395.291666666664 | 29.79 |
| 44395.302083333336 | 29.66 |
| 44395.3125 | 28.64 |
| 44395.322916666664 | 27.2 |
| 44395.333333333336 | 27.15 |
| 44395.34375 | 24.34 |
| 44395.354166666664 | 22.31 |
| 44395.364583333336 | 22.87 |
| 44395.375 | 19.46 |
| 44395.385416666664 | 23.44 |
| 44395.395833333336 | 22.97 |
| 44395.40625 | 21.65 |
| 44395.416666666664 | 19.03 |
| 44395.427083333336 | 19.66 |
| 44395.4375 | 22.9 |
| 44395.447916666664 | 21.8 |
| 44395.458333333336 | 26.18 |
| 44395.46875 | 27.04 |
| 44395.479166666664 | 30.4 |
| 44395.489583333336 | 31.3 |
| 44395.5 | 35.15 |
| 44395.510416666664 | 37.87 |
| 44395.520833333336 | 42.05 |
| 44395.53125 | 40.97 |
| 44395.541666666664 | 45.64 |
| 44395.552083333336 | 50.12 |
| 44395.5625 | 48.88 |
| 44395.572916666664 | 52.49 |
| 44395.583333333336 | 57.24 |
| 44395.59375 | 51.78 |
| 44395.604166666664 | 47.66 |
| 44395.614583333336 | 45.5 |
| 44395.625 | 42.85 |
| 44395.635416666664 | 39.8 |
| 44395.645833333336 | 35.72 |
| 44395.65625 | 33.59 |
| 44395.666666666664 | 33.65 |
| 44395.677083333336 | 32.5 |
| 44395.6875 | 33.64 |
| 44395.697916666664 | 33.99 |
| 44395.708333333336 | 36.17 |
| 44395.71875 | 37.69 |
| 44395.729166666664 | 38.71 |
| 44395.739583333336 | 39.91 |
| 44395.75 | 41.76 |
| 44395.760416666664 | 38.07 |
| 44395.770833333336 | 37.18 |
| 44395.78125 | 40.89 |
| 44395.791666666664 | 37.86 |
| 44395.802083333336 | 35.7 |
| 44395.8125 | 39.21 |
| 44395.822916666664 | 36.96 |
| 44395.833333333336 | 36.68 |
| 44395.84375 | 34.93 |
| 44395.854166666664 | 49.02 |
| 44395.864583333336 | 32.28 |
| 44395.875 | 36.15 |
| 44395.885416666664 | 33.26 |
| 44395.895833333336 | 40.03 |
| 44395.90625 | 36.64 |
| 44395.916666666664 | 42.76 |
| 44395.927083333336 | 37.41 |
| 44395.9375 | 37.52 |
| 44395.947916666664 | 34.79 |
| 44395.958333333336 | 34.65 |
| 44395.96875 | 34.09 |
| 44395.979166666664 | 35.25 |
| 44395.989583333336 | 30.16 |
| 44396.0 | 33.15 |
| 44396.010416666664 | 33.29 |
| 44396.020833333336 | 30.06 |
| 44396.03125 | 32.71 |
| 44396.041666666664 | 27.56 |
| 44396.052083333336 | 27.26 |
| 44396.0625 | 27.61 |
| 44396.072916666664 | 23.48 |
| 44396.083333333336 | 23.25 |
| 44396.09375 | 21.6 |
| 44396.104166666664 | 20.51 |
| 44396.114583333336 | 16.77 |
| 44396.125 | 15.09 |
| 44396.135416666664 | 15.43 |
| 44396.145833333336 | 15.34 |
| 44396.15625 | 16.05 |
| 44396.166666666664 | 16.37 |
| 44396.177083333336 | 18.04 |
| 44396.1875 | 18.3 |
| 44396.197916666664 | 17.9 |
| 44396.208333333336 | 18.08 |
| 44396.21875 | 17.87 |
| 44396.229166666664 | 17.6 |
| 44396.239583333336 | 16.52 |
| 44396.25 | 17.39 |
| 44396.260416666664 | 17.95 |
| 44396.270833333336 | 17.63 |
| 44396.28125 | 16.29 |
| 44396.291666666664 | 20.27 |
| 44396.302083333336 | 16.81 |
| 44396.3125 | 16.36 |
| 44396.322916666664 | 15.99 |
| 44396.333333333336 | 16.66 |
| 44396.34375 | 16.21 |
| 44396.354166666664 | 14.79 |
| 44396.364583333336 | 13.34 |
| 44396.375 | 13.49 |
| 44396.385416666664 | 14.72 |
| 44396.395833333336 | 14.11 |
| 44396.40625 | 12.96 |
| 44396.416666666664 | 13.99 |
| 44396.427083333336 | 12.25 |
| 44396.4375 | 12.68 |
| 44396.447916666664 | 11.97 |
| 44396.458333333336 | 14.2 |
| 44396.46875 | 14.1 |
| 44396.479166666664 | 16.31 |
| 44396.489583333336 | 17.46 |
| 44396.5 | 18.07 |
| 44396.510416666664 | 22.32 |
| 44396.520833333336 | 24.04 |
| 44396.53125 | 28.16 |
| 44396.541666666664 | 30.91 |
| 44396.552083333336 | 35.55 |
| 44396.5625 | 38.24 |
| 44396.572916666664 | 43.45 |
| 44396.583333333336 | 45.65 |
| 44396.59375 | 49.81 |
| 44396.604166666664 | 47.92 |
| 44396.614583333336 | 51.22 |
| 44396.625 | 46.32 |
| 44396.635416666664 | 44.42 |
| 44396.645833333336 | 41.95 |
| 44396.65625 | 37.88 |
| 44396.666666666664 | 37.24 |
| 44396.677083333336 | 33.44 |
| 44396.6875 | 28.85 |
| 44396.697916666664 | 27.51 |
| 44396.708333333336 | 26.2 |
| 44396.71875 | 27.03 |
| 44396.729166666664 | 27.16 |
| 44396.739583333336 | 27.03 |
| 44396.75 | 29.93 |
| 44396.760416666664 | 30.14 |
| 44396.770833333336 | 32.39 |
| 44396.78125 | 32.87 |
| 44396.791666666664 | 35.11 |
| 44396.802083333336 | 38.88 |
| 44396.8125 | 34.69 |
| 44396.822916666664 | 35.52 |
| 44396.833333333336 | 28.67 |
| 44396.84375 | 37.07 |
| 44396.854166666664 | 30.57 |
| 44396.864583333336 | 33.51 |
| 44396.875 | 31.89 |
| 44396.885416666664 | 32.69 |
| 44396.895833333336 | 28.21 |
| 44396.90625 | 31.69 |
| 44396.916666666664 | 29.64 |
| 44396.927083333336 | 22.35 |
| 44396.9375 | 30.37 |
| 44396.947916666664 | 26.43 |
| 44396.958333333336 | 30.24 |
| 44396.96875 | 24.93 |
| 44396.979166666664 | 27.7 |
| 44396.989583333336 | 30.16 |
| 44397.0 | 28.48 |
| 44397.010416666664 | 44.81 |
| 44397.020833333336 | 23.63 |
| 44397.03125 | 25.17 |
| 44397.041666666664 | 26.51 |
| 44397.052083333336 | 23 |
| 44397.0625 | 26.58 |
| 44397.072916666664 | 24.9 |
| 44397.083333333336 | 25.29 |
| 44397.09375 | 27.28 |
| 44397.104166666664 | 24.77 |
| 44397.114583333336 | 21.47 |
| 44397.125 | 21.23 |
| 44397.135416666664 | 21.35 |
| 44397.145833333336 | 23.39 |
| 44397.15625 | 20.63 |
| 44397.166666666664 | 15.02 |
| 44397.177083333336 | 15.23 |
| 44397.1875 | 16.03 |
| 44397.197916666664 | 15.79 |
| 44397.208333333336 | 15.99 |
| 44397.21875 | 15.78 |
| 44397.229166666664 | 17.26 |
| 44397.239583333336 | 17.61 |
| 44397.25 | 16.6 |
| 44397.260416666664 | 24.38 |
| 44397.270833333336 | 18.1 |
| 44397.28125 | 16 |
| 44397.291666666664 | 15.72 |
| 44397.302083333336 | 15.96 |
| 44397.3125 | 15.24 |
| 44397.322916666664 | 15.22 |
| 44397.333333333336 | 15.65 |
| 44397.34375 | 14.98 |
| 44397.354166666664 | 15.56 |
| 44397.364583333336 | 15.35 |
| 44397.375 | 17.47 |
| 44397.385416666664 | 13.97 |
| 44397.395833333336 | 13.67 |
| 44397.40625 | 11.08 |
| 44397.416666666664 | 16.55 |
| 44397.427083333336 | 14.68 |
| 44397.4375 | 12.54 |
| 44397.447916666664 | 12.36 |
| 44397.458333333336 | 10.89 |
| 44397.46875 | 10.28 |
| 44397.479166666664 | 10.35 |
| 44397.489583333336 | 12.11 |
| 44397.5 | 13.63 |
| 44397.510416666664 | 13.7 |
| 44397.520833333336 | 13.86 |
| 44397.53125 | 12.26 |
| 44397.541666666664 | 16.31 |
| 44397.552083333336 | 19.36 |
| 44397.5625 | 19.92 |
| 44397.572916666664 | 21.55 |
| 44397.583333333336 | 24.13 |
| 44397.59375 | 23.73 |
| 44397.604166666664 | 27.84 |
| 44397.614583333336 | 30.58 |
| 44397.625 | 37.43 |
| 44397.635416666664 | 41.44 |
| 44397.645833333336 | 43.61 |
| 44397.65625 | 37.73 |
| 44397.666666666664 | 41.05 |
| 44397.677083333336 | 43.06 |
| 44397.6875 | 36.85 |
| 44397.697916666664 | 37.71 |
| 44397.708333333336 | 33.43 |
| 44397.71875 | 32.28 |
| 44397.729166666664 | 28.58 |
| 44397.739583333336 | 27.19 |
| 44397.75 | 26.25 |
| 44397.760416666664 | 25.43 |
| 44397.770833333336 | 27.86 |
| 44397.78125 | 29.39 |
| 44397.791666666664 | 29.19 |
| 44397.802083333336 | 29.55 |
| 44397.8125 | 32.18 |
| 44397.822916666664 | 34.91 |
| 44397.833333333336 | 36.42 |
| 44397.84375 | 36.19 |
| 44397.854166666664 | 37.24 |
| 44397.864583333336 | 36.29 |
| 44397.875 | 33.14 |
| 44397.885416666664 | 38.52 |
| 44397.895833333336 | 38.94 |
| 44397.90625 | 39.05 |
| 44397.916666666664 | 45.48 |
| 44397.927083333336 | 37.63 |
| 44397.9375 | 41.23 |
| 44397.947916666664 | 39.68 |
| 44397.958333333336 | 42.16 |
| 44397.96875 | 44.52 |
| 44397.979166666664 | 35.09 |
| 44397.989583333336 | 29.09 |
| 44398.0 | 31.51 |
| 44398.010416666664 | 36.84 |
| 44398.020833333336 | 35.61 |
| 44398.03125 | 36.57 |
| 44398.041666666664 | 31.6 |
| 44398.052083333336 | 30.92 |
| 44398.0625 | 29.77 |
| 44398.072916666664 | 27.45 |
| 44398.083333333336 | 20.95 |
| 44398.09375 | 22.73 |
| 44398.104166666664 | 23.52 |
| 44398.114583333336 | 28.64 |
| 44398.125 | 25.3 |
| 44398.135416666664 | 24.83 |
| 44398.145833333336 | 24.5 |
| 44398.15625 | 22.67 |
| 44398.166666666664 | 22.72 |
| 44398.177083333336 | 21.08 |
| 44398.1875 | 21.08 |
| 44398.197916666664 | 19.29 |
| 44398.208333333336 | 19.69 |
| 44398.21875 | 18.03 |
| 44398.229166666664 | 16.95 |
| 44398.239583333336 | 17.74 |
| 44398.25 | 16.76 |
| 44398.260416666664 | 17 |
| 44398.270833333336 | 18.26 |
| 44398.28125 | 19.65 |
| 44398.291666666664 | 16.45 |
| 44398.302083333336 | 18.51 |
| 44398.3125 | 18.02 |
| 44398.322916666664 | 19.2 |
| 44398.333333333336 | 17.51 |
| 44398.34375 | 17.87 |
| 44398.354166666664 | 17.81 |
| 44398.364583333336 | 16.92 |
| 44398.375 | 17.01 |
| 44398.385416666664 | 16.68 |
| 44398.395833333336 | 16.82 |
| 44398.40625 | 17.68 |
| 44398.416666666664 | 21.15 |
| 44398.427083333336 | 20.08 |
| 44398.4375 | 19 |
| 44398.447916666664 | 15.05 |
| 44398.458333333336 | 19.52 |
| 44398.46875 | 13.95 |
| 44398.479166666664 | 13.78 |
| 44398.489583333336 | 20.21 |
| 44398.5 | 13.97 |
| 44398.510416666664 | 12.58 |
| 44398.520833333336 | 14.4 |
| 44398.53125 | 13.24 |
| 44398.541666666664 | 14.99 |
| 44398.552083333336 | 14.77 |
| 44398.5625 | 14.92 |
| 44398.572916666664 | 13.06 |
| 44398.583333333336 | 17.93 |
| 44398.59375 | 18.07 |
| 44398.604166666664 | 18.37 |
| 44398.614583333336 | 23.16 |
| 44398.625 | 21.85 |
| 44398.635416666664 | 24.73 |
| 44398.645833333336 | 27.42 |
| 44398.65625 | 29.16 |
| 44398.666666666664 | 34.23 |
| 44398.677083333336 | 36.93 |
| 44398.6875 | 41.01 |
| 44398.697916666664 | 41.54 |
| 44398.708333333336 | 45.25 |
| 44398.71875 | 38.59 |
| 44398.729166666664 | 39.14 |
| 44398.739583333336 | 36.23 |
| 44398.75 | 35.85 |
| 44398.760416666664 | 32.69 |
| 44398.770833333336 | 33.7 |
| 44398.78125 | 32.85 |
| 44398.791666666664 | 33.07 |
| 44398.802083333336 | 34.1 |
| 44398.8125 | 35.11 |
| 44398.822916666664 | 36.75 |
| 44398.833333333336 | 37.76 |
| 44398.84375 | 48.58 |
| 44398.854166666664 | 43.64 |
| 44398.864583333336 | 40.35 |
| 44398.875 | 43.74 |
| 44398.885416666664 | 46.53 |
| 44398.895833333336 | 45.88 |
| 44398.90625 | 46.35 |
| 44398.916666666664 | 49.41 |
| 44398.927083333336 | 45.53 |
| 44398.9375 | 43.59 |
| 44398.947916666664 | 45.96 |
| 44398.958333333336 | 38.09 |
| 44398.96875 | 49.84 |
| 44398.979166666664 | 38.13 |
| 44398.989583333336 | 38.95 |
| 44399.0 | 36.19 |
| 44399.010416666664 | 30.57 |
| 44399.020833333336 | 27.32 |
| 44399.03125 | 28.21 |
| 44399.041666666664 | 30.59 |
| 44399.052083333336 | 33.88 |
| 44399.0625 | 33.96 |
| 44399.072916666664 | 35.25 |
| 44399.083333333336 | 32.81 |
| 44399.09375 | 28.66 |
| 44399.104166666664 | 25.53 |
| 44399.114583333336 | 24.12 |
| 44399.125 | 22.41 |
| 44399.135416666664 | 23.22 |
| 44399.145833333336 | 23.14 |
| 44399.15625 | 24.36 |
| 44399.166666666664 | 26.46 |
| 44399.177083333336 | 29.89 |
| 44399.1875 | 23.69 |
| 44399.197916666664 | 23.37 |
| 44399.208333333336 | 22.33 |
| 44399.21875 | 21.42 |
| 44399.229166666664 | 20.38 |
| 44399.239583333336 | 19.68 |
| 44399.25 | 20.08 |
| 44399.260416666664 | 16.19 |
| 44399.270833333336 | 16.98 |
| 44399.28125 | 16.23 |
| 44399.291666666664 | 15.63 |
| 44399.302083333336 | 15.77 |
| 44399.3125 | 16.1 |
| 44399.322916666664 | 16.22 |
| 44399.333333333336 | 15.89 |
| 44399.34375 | 15.48 |
| 44399.354166666664 | 15.38 |
| 44399.364583333336 | 14.92 |
| 44399.375 | 14.92 |
| 44399.385416666664 | 17.63 |
| 44399.395833333336 | 17.49 |
| 44399.40625 | 22.31 |
| 44399.416666666664 | 17.82 |
| 44399.427083333336 | 18.05 |
| 44399.4375 | 16.23 |
| 44399.447916666664 | 14.97 |
| 44399.458333333336 | 14.9 |
| 44399.46875 | 13.89 |
| 44399.479166666664 | 14.07 |
| 44399.489583333336 | 12.22 |
| 44399.5 | 9.82 |
| 44399.510416666664 | 12.96 |
| 44399.520833333336 | 13 |
| 44399.53125 | 12.53 |
| 44399.541666666664 | 12.99 |
| 44399.552083333336 | 12.27 |
| 44399.5625 | 11.81 |
| 44399.572916666664 | 12.63 |
| 44399.583333333336 | 12.65 |
| 44399.59375 | 12.49 |
| 44399.604166666664 | 13.57 |
| 44399.614583333336 | 14.5 |
| 44399.625 | 15.98 |
| 44399.635416666664 | 15.47 |
| 44399.645833333336 | 18.96 |
| 44399.65625 | 22.83 |
| 44399.666666666664 | 20.64 |
| 44399.677083333336 | 26.12 |
| 44399.6875 | 24.38 |
| 44399.697916666664 | 31.89 |
| 44399.708333333336 | 40.45 |
| 44399.71875 | 48.62 |
| 44399.729166666664 | 49.19 |
| 44399.739583333336 | 65.67 |
| 44399.75 | 55.95 |
| 44399.760416666664 | 51.55 |
| 44399.770833333336 | 52.51 |
| 44399.78125 | 45.93 |
| 44399.791666666664 | 42.78 |
| 44399.802083333336 | 39.21 |
| 44399.8125 | 34.2 |
| 44399.822916666664 | 29.92 |
| 44399.833333333336 | 26.81 |
| 44399.84375 | 27.94 |
| 44399.854166666664 | 30.16 |
| 44399.864583333336 | 31.41 |
| 44399.875 | 31.85 |
| 44399.885416666664 | 32.94 |
| 44399.895833333336 | 32.05 |
| 44399.90625 | 38.85 |
| 44399.916666666664 | 37.52 |
| 44399.927083333336 | 43.57 |
| 44399.9375 | 34.25 |
| 44399.947916666664 | 34.77 |
| 44399.958333333336 | 43.88 |
| 44399.96875 | 32.74 |
| 44399.979166666664 | 40.65 |
| 44399.989583333336 | 31.15 |
| 44400.0 | 33.23 |
| 44400.010416666664 | 26.66 |
| 44400.020833333336 | 24.02 |
| 44400.03125 | 21.19 |
| 44400.041666666664 | 19.41 |
| 44400.052083333336 | 20.86 |
| 44400.0625 | 33.53 |
| 44400.072916666664 | 29.2 |
| 44400.083333333336 | 25.73 |
| 44400.09375 | 19.74 |
| 44400.104166666664 | 20.73 |
| 44400.114583333336 | 23.36 |
| 44400.125 | 15.39 |
| 44400.135416666664 | 19.88 |
| 44400.145833333336 | 18.45 |
| 44400.15625 | 13.41 |
| 44400.166666666664 | 15.1 |
| 44400.177083333336 | 15.62 |
| 44400.1875 | 14.96 |
| 44400.197916666664 | 17.74 |
| 44400.208333333336 | 18.97 |
| 44400.21875 | 19.49 |
| 44400.229166666664 | 18.53 |
| 44400.239583333336 | 18.05 |
| 44400.25 | 18.58 |
| 44400.260416666664 | 16.93 |
| 44400.270833333336 | 17.26 |
| 44400.28125 | 16.18 |
| 44400.291666666664 | 14.36 |
| 44400.302083333336 | 14.41 |
| 44400.3125 | 13.6 |
| 44400.322916666664 | 14 |
| 44400.333333333336 | 13.61 |
| 44400.34375 | 13.58 |
| 44400.354166666664 | 13.63 |
| 44400.364583333336 | 13.76 |
| 44400.375 | 16.17 |
| 44400.385416666664 | 14.07 |
| 44400.395833333336 | 20.26 |
| 44400.40625 | 15.68 |
| 44400.416666666664 | 15.2 |
| 44400.427083333336 | 14.5 |
| 44400.4375 | 15.01 |
| 44400.447916666664 | 13.66 |
| 44400.458333333336 | 13.59 |
| 44400.46875 | 11.97 |
| 44400.479166666664 | 12.29 |
| 44400.489583333336 | 10.44 |
| 44400.5 | 11.39 |
| 44400.510416666664 | 11.04 |
| 44400.520833333336 | 9.94 |
| 44400.53125 | 9.31 |
| 44400.541666666664 | 10.36 |
| 44400.552083333336 | 11.01 |
| 44400.5625 | 10.33 |
| 44400.572916666664 | 10.83 |
| 44400.583333333336 | 10.08 |
| 44400.59375 | 11.14 |
| 44400.604166666664 | 11.21 |
| 44400.614583333336 | 11.5 |
| 44400.625 | 11.7 |
| 44400.635416666664 | 11.3 |
| 44400.645833333336 | 14.62 |
| 44400.65625 | 15.28 |
| 44400.666666666664 | 17.08 |
| 44400.677083333336 | 18.9 |
| 44400.6875 | 23.1 |
| 44400.697916666664 | 30.33 |
| 44400.708333333336 | 34.5 |
| 44400.71875 | 36.74 |
| 44400.729166666664 | 39.66 |
| 44400.739583333336 | 52.79 |
| 44400.75 | 59.15 |
| 44400.760416666664 | 56.53 |
| 44400.770833333336 | 58.74 |
| 44400.78125 | 58.07 |
| 44400.791666666664 | 60.1 |
| 44400.802083333336 | 59.91 |
| 44400.8125 | 60.51 |
| 44400.822916666664 | 58.92 |
| 44400.833333333336 | 55.35 |
| 44400.84375 | 52.62 |
| 44400.854166666664 | 42.77 |
| 44400.864583333336 | 39.25 |
| 44400.875 | 34.02 |
| 44400.885416666664 | 32.02 |
| 44400.895833333336 | 29.69 |
| 44400.90625 | 27.91 |
| 44400.916666666664 | 25.92 |
| 44400.927083333336 | 26.64 |
| 44400.9375 | 25.31 |
| 44400.947916666664 | 25.75 |
| 44400.958333333336 | 24.15 |
| 44400.96875 | 23.78 |
| 44400.979166666664 | 18.79 |
| 44400.989583333336 | 20.7 |
| 44401.0 | 17.91 |
| 44401.010416666664 | 21.96 |
| 44401.020833333336 | 21.83 |
| 44401.03125 | 20.26 |
| 44401.041666666664 | 19.5 |
| 44401.052083333336 | 16.68 |
| 44401.0625 | 16.12 |
| 44401.072916666664 | 13.5 |
| 44401.083333333336 | 15.4 |
| 44401.09375 | 22.04 |
| 44401.104166666664 | 13.22 |
| 44401.114583333336 | 13.09 |
| 44401.125 | 11.41 |
| 44401.135416666664 | 12.52 |
| 44401.145833333336 | 14.06 |
| 44401.15625 | 13.33 |
| 44401.166666666664 | 11.42 |
| 44401.177083333336 | 11.44 |
| 44401.1875 | 11.32 |
| 44401.197916666664 | 9.91 |
| 44401.208333333336 | 9.72 |
| 44401.21875 | 12.07 |
| 44401.229166666664 | 13.34 |
| 44401.239583333336 | 12.68 |
| 44401.25 | 14.96 |
| 44401.260416666664 | 14.89 |
| 44401.270833333336 | 15.62 |
| 44401.28125 | 16.58 |
| 44401.291666666664 | 15.22 |
| 44401.302083333336 | 14.26 |
| 44401.3125 | 14.41 |
| 44401.322916666664 | 16.26 |
| 44401.333333333336 | 14.84 |
| 44401.34375 | 11.6 |
| 44401.354166666664 | 11.93 |
| 44401.364583333336 | 11.31 |
| 44401.375 | 14.23 |
| 44401.385416666664 | 14.06 |
| 44401.395833333336 | 16.04 |
| 44401.40625 | 14.47 |
| 44401.416666666664 | 13.46 |
| 44401.427083333336 | 12.56 |
| 44401.4375 | 12.28 |
| 44401.447916666664 | 12.31 |
| 44401.458333333336 | 12.19 |
| 44401.46875 | 11.99 |
| 44401.479166666664 | 11.58 |
| 44401.489583333336 | 11.41 |
| 44401.5 | 11.34 |
| 44401.510416666664 | 11.39 |
| 44401.520833333336 | 12.17 |
| 44401.53125 | 11.6 |
| 44401.541666666664 | 12.13 |
| 44401.552083333336 | 12.2 |
| 44401.5625 | 10.04 |
| 44401.572916666664 | 9.98 |
| 44401.583333333336 | 10.31 |
| 44401.59375 | 10.68 |
| 44401.604166666664 | 10.82 |
| 44401.614583333336 | 13.14 |
| 44401.625 | 8.83 |
| 44401.635416666664 | 11.36 |
| 44401.645833333336 | 12.04 |
| 44401.65625 | 13.14 |
| 44401.666666666664 | 13.89 |
| 44401.677083333336 | 14.62 |
| 44401.6875 | 15.53 |
| 44401.697916666664 | 17.88 |
| 44401.708333333336 | 19.3 |
| 44401.71875 | 21.7 |
| 44401.729166666664 | 29.16 |
| 44401.739583333336 | 34.8 |
| 44401.75 | 38.45 |
| 44401.760416666664 | 45.82 |
| 44401.770833333336 | 51.55 |
| 44401.78125 | 54.98 |
| 44401.791666666664 | 58.72 |
| 44401.802083333336 | 70.09 |
| 44401.8125 | 76.86 |
| 44401.822916666664 | 77.67 |
| 44401.833333333336 | 66.77 |
| 44401.84375 | 64.84 |
| 44401.854166666664 | 60.76 |
| 44401.864583333336 | 52.34 |
| 44401.875 | 51.9 |
| 44401.885416666664 | 48.21 |
| 44401.895833333336 | 46.41 |
| 44401.90625 | 41.93 |
| 44401.916666666664 | 40.66 |
| 44401.927083333336 | 36.18 |
| 44401.9375 | 38.39 |
| 44401.947916666664 | 34.4 |
| 44401.958333333336 | 31.02 |
| 44401.96875 | 29.34 |
| 44401.979166666664 | 27.81 |
| 44401.989583333336 | 24.95 |
| 44402.0 | 24.53 |
| 44402.010416666664 | 24.69 |
| 44402.020833333336 | 23.31 |
| 44402.03125 | 24.75 |
| 44402.041666666664 | 24.65 |
| 44402.052083333336 | 21.8 |
| 44402.06267361111 | 25.58 |
| 44402.072916666664 | 19.94 |
| 44402.083333333336 | 20.85 |
| 44402.09375 | 17.55 |
| 44402.104166666664 | 15.16 |
| 44402.114583333336 | 14.36 |
| 44402.125 | 14.97 |
| 44402.135416666664 | 15.4 |
| 44402.145833333336 | 16.33 |
| 44402.15625 | 17.7 |
| 44402.166666666664 | 20.75 |
| 44402.177083333336 | 16.17 |
| 44402.1875 | 16.42 |
| 44402.197916666664 | 16.74 |
| 44402.208333333336 | 16.95 |
| 44402.21875 | 15.81 |
| 44402.229166666664 | 14.96 |
| 44402.239583333336 | 14.94 |
| 44402.25 | 17.21 |
| 44402.260416666664 | 18.55 |
| 44402.270833333336 | 18.87 |
| 44402.28125 | 20.36 |
| 44402.291666666664 | 18.85 |
| 44402.302083333336 | 19.74 |
| 44402.3125 | 19.41 |
| 44402.322916666664 | 19.47 |
| 44402.333333333336 | 18.31 |
| 44402.34375 | 17.61 |
| 44402.354166666664 | 19.16 |
| 44402.364583333336 | 16.47 |
| 44402.375 | 14.12 |
| 44402.385416666664 | 13.82 |
| 44402.395833333336 | 14.18 |
| 44402.40625 | 15.77 |
| 44402.416666666664 | 15.89 |
| 44402.427083333336 | 16.12 |
| 44402.4375 | 17.05 |
| 44402.447916666664 | 18.11 |
| 44402.458333333336 | 17.92 |
| 44402.46875 | 18.94 |
| 44402.479166666664 | 18.46 |
| 44402.489583333336 | 19.7 |
| 44402.5 | 19.02 |
| 44402.510416666664 | 18.96 |
| 44402.520833333336 | 19.12 |
| 44402.53125 | 18.95 |
| 44402.541666666664 | 18.29 |
| 44402.552083333336 | 16.96 |
| 44402.5625 | 16.66 |
| 44402.572916666664 | 16.41 |
| 44402.583333333336 | 17.75 |
| 44402.59375 | 17.8 |
| 44402.604166666664 | 16.75 |
| 44402.614583333336 | 14.24 |
| 44402.625 | 18.19 |
| 44402.635416666664 | 19.29 |
| 44402.645833333336 | 21.04 |
| 44402.65625 | 17.55 |
| 44402.666666666664 | 16.6 |
| 44402.677083333336 | 18.05 |
| 44402.6875 | 17.4 |
| 44402.697916666664 | 18.09 |
| 44402.708333333336 | 19.83 |
| 44402.71875 | 20 |
| 44402.729166666664 | 22.1 |
| 44402.739583333336 | 24.9 |
| 44402.75 | 29.7 |
| 44402.760416666664 | 34.03 |
| 44402.770833333336 | 37.04 |
| 44402.78125 | 41.37 |
| 44402.791666666664 | 44.76 |
| 44402.802083333336 | 47.21 |
| 44402.8125 | 50.06 |
| 44402.822916666664 | 54.3 |
| 44402.833333333336 | 57.71 |
| 44402.84375 | 55.49 |
| 44402.854166666664 | 55.56 |
| 44402.864583333336 | 53.84 |
| 44402.875 | 49.98 |
| 44402.885416666664 | 46.49 |
| 44402.895833333336 | 40.87 |
| 44402.90625 | 36.2 |
| 44402.916666666664 | 34.6 |
| 44402.927083333336 | 31.81 |
| 44402.9375 | 33.79 |
| 44402.947916666664 | 37.19 |
| 44402.958333333336 | 37.86 |
| 44402.96875 | 37.75 |
| 44402.979166666664 | 35.38 |
| 44402.989583333336 | 35.79 |
| 44403.0 | 36.42 |
| 44403.010416666664 | 34.2 |
| 44403.020833333336 | 31.55 |
| 44403.03125 | 33.89 |
| 44403.041666666664 | 29.11 |
| 44403.052083333336 | 28.68 |
| 44403.0625 | 28.44 |
| 44403.072916666664 | 26.51 |
| 44403.083333333336 | 25.03 |
| 44403.09375 | 23.22 |
| 44403.104166666664 | 24.55 |
| 44403.114583333336 | 23.37 |
| 44403.125 | 23.4 |
| 44403.135416666664 | 18.08 |
| 44403.145833333336 | 16.02 |
| 44403.15625 | 17.72 |
| 44403.166666666664 | 17.05 |
| 44403.177083333336 | 19.98 |
| 44403.1875 | 18.55 |
| 44403.197916666664 | 15.97 |
| 44403.208333333336 | 18.15 |
| 44403.21875 | 18.83 |
| 44403.229166666664 | 16.28 |
| 44403.239583333336 | 16.32 |
| 44403.25 | 18.23 |
| 44403.260416666664 | 16.48 |
| 44403.270833333336 | 18.95 |
| 44403.28125 | 20.17 |
| 44403.291666666664 | 18.29 |
| 44403.302083333336 | 19.2 |
| 44403.3125 | 18.44 |
| 44403.322916666664 | 20.31 |
| 44403.333333333336 | 19.67 |
| 44403.34375 | 19.3 |
| 44403.354166666664 | 19 |
| 44403.364583333336 | 18.82 |
| 44403.375 | 18.86 |
| 44403.385416666664 | 18.32 |
| 44403.395833333336 | 15.22 |
| 44403.40625 | 15.51 |
| 44403.416666666664 | 15.13 |
| 44403.427083333336 | 14.32 |
| 44403.4375 | 13.04 |
| 44403.447916666664 | 15.2 |
| 44403.458333333336 | 16.44 |
| 44403.46875 | 16.88 |
| 44403.479166666664 | 16.76 |
| 44403.489583333336 | 17.61 |
| 44403.5 | 18.07 |
| 44403.510416666664 | 17.77 |
| 44403.520833333336 | 18.13 |
| 44403.53125 | 17.88 |
| 44403.541666666664 | 17.46 |
| 44403.552083333336 | 17.24 |
| 44403.5625 | 17.6 |
| 44403.572916666664 | 18.7 |
| 44403.583333333336 | 17.45 |
| 44403.59375 | 18.76 |
| 44403.604166666664 | 20.83 |
| 44403.614583333336 | 19.38 |
| 44403.625 | 19.75 |
| 44403.635416666664 | 22.45 |
| 44403.645833333336 | 15.62 |
| 44403.65625 | 24.68 |
| 44403.666666666664 | 21.6 |
| 44403.677083333336 | 24.21 |
| 44403.6875 | 20.08 |
| 44403.697916666664 | 18.6 |
| 44403.708333333336 | 21.11 |
| 44403.71875 | 17.35 |
| 44403.729166666664 | 19.57 |
| 44403.739583333336 | 17.22 |
| 44403.75 | 26.21 |
| 44403.760416666664 | 20.38 |
| 44403.770833333336 | 22.33 |
| 44403.78125 | 24.09 |
| 44403.791666666664 | 26.18 |
| 44403.802083333336 | 29.05 |
| 44403.8125 | 31.73 |
| 44403.822916666664 | 32.19 |
| 44403.833333333336 | 37.65 |
| 44403.84375 | 35.41 |
| 44403.854166666664 | 43.24 |
| 44403.864583333336 | 47.17 |
| 44403.875 | 50.06 |
| 44403.885416666664 | 55.44 |
| 44403.895833333336 | 52.82 |
| 44403.90625 | 41.32 |
| 44403.916666666664 | 42.51 |
| 44403.927083333336 | 34.35 |
| 44403.9375 | 30.49 |
| 44403.947916666664 | 26.18 |
| 44403.958333333336 | 26.16 |
| 44403.96875 | 25.49 |
| 44403.979166666664 | 23.75 |
| 44403.989583333336 | 22.95 |
| 44404.0 | 22.54 |
| 44404.010416666664 | 21.83 |
| 44404.020833333336 | 20.21 |
| 44404.03125 | 19.36 |
| 44404.041666666664 | 19.36 |
| 44404.052083333336 | 19.51 |
| 44404.0625 | 18.36 |
| 44404.072916666664 | 18.18 |
| 44404.083333333336 | 15.75 |
| 44404.09375 | 19.26 |
| 44404.104166666664 | 15.85 |
| 44404.114583333336 | 17.21 |
| 44404.125 | 15.21 |
| 44404.135416666664 | 17.6 |
| 44404.145833333336 | 14.92 |
| 44404.15625 | 16.24 |
| 44404.166666666664 | 15.81 |
| 44404.177083333336 | 13.94 |
| 44404.1875 | 13.7 |
| 44404.197916666664 | 14.29 |
| 44404.208333333336 | 12.27 |
| 44404.21875 | 13.99 |
| 44404.229166666664 | 11.19 |
| 44404.239583333336 | 12.84 |
| 44404.25 | 13.61 |
| 44404.260416666664 | 10.49 |
| 44404.270833333336 | 11.37 |
| 44404.28125 | 11.73 |
| 44404.291666666664 | 11.29 |
| 44404.302083333336 | 11.97 |
| 44404.3125 | 11.97 |
| 44404.322916666664 | 11.31 |
| 44404.333333333336 | 13.34 |
| 44404.34375 | 14.44 |
| 44404.354166666664 | 12.5 |
| 44404.364583333336 | 14.49 |
| 44404.375 | 13.41 |
| 44404.385416666664 | 13.83 |
| 44404.395833333336 | 13.48 |
| 44404.40625 | 12.92 |
| 44404.416666666664 | 11.7 |
| 44404.427083333336 | 12.07 |
| 44404.4375 | 11.31 |
| 44404.447916666664 | 10.46 |
| 44404.458333333336 | 9.92 |
| 44404.46875 | 9.44 |
| 44404.479166666664 | 9.62 |
| 44404.489583333336 | 9.91 |
| 44404.5 | 10.48 |
| 44404.510416666664 | 10.78 |
| 44404.520833333336 | 10.96 |
| 44404.53125 | 10.29 |
| 44404.541666666664 | 11.23 |
| 44404.552083333336 | 11.08 |
| 44404.5625 | 11.91 |
| 44404.572916666664 | 12.03 |
| 44404.583333333336 | 12.78 |
| 44404.59375 | 14.14 |
| 44404.604166666664 | 13.28 |
| 44404.614583333336 | 13.66 |
| 44404.625 | 14.2 |
| 44404.635416666664 | 12.97 |
| 44404.645833333336 | 13.32 |
| 44404.65625 | 15.47 |
| 44404.666666666664 | 16.24 |
| 44404.677083333336 | 13.92 |
| 44404.6875 | 14.04 |
| 44404.697916666664 | 15.94 |
| 44404.708333333336 | 15.79 |
| 44404.71875 | 9.54 |
| 44404.729166666664 | 14.01 |
| 44404.739583333336 | 11.21 |
| 44404.75 | 12.66 |
| 44404.760416666664 | 12.67 |
| 44404.770833333336 | 11.91 |
| 44404.78125 | 12.21 |
| 44404.791666666664 | 12.29 |
| 44404.802083333336 | 11.11 |
| 44404.8125 | 13.21 |
| 44404.822916666664 | 19.89 |
| 44404.833333333336 | 17.29 |
| 44404.84375 | 18.37 |
| 44404.854166666664 | 21.09 |
| 44404.864583333336 | 21.6 |
| 44404.875 | 23.96 |
| 44404.885416666664 | 25.31 |
| 44404.895833333336 | 29.95 |
| 44404.90625 | 31.49 |
| 44404.916666666664 | 31.3 |
| 44404.927083333336 | 30.53 |
| 44404.9375 | 30.85 |
| 44404.947916666664 | 27.21 |
| 44404.958333333336 | 24.67 |
| 44404.96875 | 20.6 |
| 44404.979166666664 | 18.48 |
| 44404.989583333336 | 21.13 |
| 44405.0 | 20.41 |
| 44405.010416666664 | 21.03 |
| 44405.020833333336 | 21.38 |
| 44405.03125 | 20.21 |
| 44405.041666666664 | 19.93 |
| 44405.052083333336 | 20.36 |
| 44405.0625 | 19.32 |
| 44405.072916666664 | 18.7 |
| 44405.083333333336 | 18.35 |
| 44405.09375 | 17.84 |
| 44405.104166666664 | 17.2 |
| 44405.114583333336 | 18.2 |
| 44405.125 | 17.06 |
| 44405.135416666664 | 16.8 |
| 44405.145833333336 | 16.33 |
| 44405.15625 | 16.83 |
| 44405.166666666664 | 17.49 |
| 44405.177083333336 | 16.86 |
| 44405.1875 | 17.54 |
| 44405.197916666664 | 16.04 |
| 44405.208333333336 | 15.76 |
| 44405.21875 | 15.67 |
| 44405.229166666664 | 16.58 |
| 44405.239583333336 | 13.89 |
| 44405.25 | 13.99 |
| 44405.260416666664 | 12.69 |
| 44405.270833333336 | 12.23 |
| 44405.28125 | 13.07 |
| 44405.291666666664 | 10.8 |
| 44405.302083333336 | 11.45 |
| 44405.3125 | 11.32 |
| 44405.322916666664 | 12.79 |
| 44405.333333333336 | 12.68 |
| 44405.34375 | 13.06 |
| 44405.354166666664 | 12.74 |
| 44405.364583333336 | 13.43 |
| 44405.375 | 13.64 |
| 44405.385416666664 | 13.84 |
| 44405.395833333336 | 13.51 |
| 44405.40625 | 13.93 |
| 44405.416666666664 | 13.81 |
| 44405.427083333336 | 12.62 |
| 44405.4375 | 12.83 |
| 44405.447916666664 | 12.54 |
| 44405.458333333336 | 12.06 |
| 44405.46875 | 12.05 |
| 44405.479166666664 | 11.86 |
| 44405.489583333336 | 10.94 |
| 44405.5 | 11.06 |
| 44405.510416666664 | 11.29 |
| 44405.520833333336 | 12.07 |
| 44405.53125 | 12.83 |
| 44405.541666666664 | 12.76 |
| 44405.552083333336 | 12.46 |
| 44405.5625 | 13.02 |
| 44405.572916666664 | 13.56 |
| 44405.583333333336 | 13.24 |
| 44405.59375 | 13.72 |
| 44405.604166666664 | 14.85 |
| 44405.614583333336 | 16.45 |
| 44405.625 | 17.56 |
| 44405.635416666664 | 18.88 |
| 44405.645833333336 | 19.25 |
| 44405.65625 | 32.41 |
| 44405.666666666664 | 21.39 |
| 44405.677083333336 | 21.51 |
| 44405.6875 | 21.34 |
| 44405.697916666664 | 22.81 |
| 44405.708333333336 | 29.92 |
| 44405.71875 | 19.42 |
| 44405.729166666664 | 19.74 |
| 44405.739583333336 | 29.96 |
| 44405.75 | 23.43 |
| 44405.760416666664 | 23.02 |
| 44405.770833333336 | 22.26 |
| 44405.78125 | 20.73 |
| 44405.791666666664 | 20.72 |
| 44405.802083333336 | 20.17 |
| 44405.8125 | 21.23 |
| 44405.822916666664 | 19.83 |
| 44405.833333333336 | 23.17 |
| 44405.84375 | 24.34 |
| 44405.854166666664 | 27.4 |
| 44405.864583333336 | 27.57 |
| 44405.875 | 29.68 |
| 44405.885416666664 | 34.16 |
| 44405.895833333336 | 35.58 |
| 44405.90625 | 38.58 |
| 44405.916666666664 | 39.41 |
| 44405.927083333336 | 42.17 |
| 44405.9375 | 40.89 |
| 44405.947916666664 | 40.01 |
| 44405.958333333336 | 37.36 |
| 44405.96875 | 36.06 |
| 44405.979166666664 | 35.33 |
| 44405.989583333336 | 31.62 |
| 44406.0 | 28.89 |
| 44406.010416666664 | 26.77 |
| 44406.020833333336 | 27.53 |
| 44406.03125 | 26.49 |
| 44406.041666666664 | 25.03 |
| 44406.052083333336 | 25.3 |
| 44406.0625 | 22.88 |
| 44406.072916666664 | 23.36 |
| 44406.083333333336 | 23.78 |
| 44406.09375 | 22.83 |
| 44406.104166666664 | 21.04 |
| 44406.114583333336 | 20.93 |
| 44406.125 | 21.47 |
| 44406.135416666664 | 20.44 |
| 44406.145833333336 | 20.1 |
| 44406.15625 | 20.53 |
| 44406.166666666664 | 20.56 |
| 44406.177083333336 | 21.22 |
| 44406.1875 | 19.95 |
| 44406.197916666664 | 18.29 |
| 44406.208333333336 | 20.4 |
| 44406.21875 | 17.59 |
| 44406.229166666664 | 19.66 |
| 44406.239583333336 | 16.24 |
| 44406.25 | 19.38 |
| 44406.260416666664 | 18.09 |
| 44406.270833333336 | 32.4 |
| 44406.28125 | 14.53 |
| 44406.291666666664 | 15.76 |
| 44406.302083333336 | 12.2 |
| 44406.3125 | 15.28 |
| 44406.322916666664 | 14.36 |
| 44406.333333333336 | 15.7 |
| 44406.34375 | 15.27 |
| 44406.354166666664 | 15.77 |
| 44406.364583333336 | 16.99 |
| 44406.375 | 16.63 |
| 44406.385416666664 | 17.6 |
| 44406.395833333336 | 14.93 |
| 44406.40625 | 17.08 |
| 44406.416666666664 | 18.12 |
| 44406.427083333336 | 17.05 |
| 44406.4375 | 15.39 |
| 44406.447916666664 | 16.51 |
| 44406.458333333336 | 15.54 |
| 44406.46875 | 16.11 |
| 44406.479166666664 | 16.72 |
| 44406.489583333336 | 17.52 |
| 44406.5 | 16.15 |
| 44406.510416666664 | 15.89 |
| 44406.520833333336 | 15.58 |
| 44406.53125 | 15.05 |
| 44406.541666666664 | 14.79 |
| 44406.552083333336 | 15.46 |
| 44406.5625 | 15.46 |
| 44406.572916666664 | 16.17 |
| 44406.583333333336 | 16.96 |
| 44406.59375 | 17.14 |
| 44406.604166666664 | 17.89 |
| 44406.614583333336 | 18.47 |
| 44406.625 | 17.86 |
| 44406.635416666664 | 19.47 |
| 44406.645833333336 | 19.43 |
| 44406.65625 | 31.59 |
| 44406.666666666664 | 19.95 |
| 44406.677083333336 | 22.18 |
| 44406.6875 | 21.66 |
| 44406.697916666664 | 22.88 |
| 44406.708333333336 | 37.28 |
| 44406.71875 | 27.44 |
| 44406.729166666664 | 33.75 |
| 44406.739583333336 | 33.76 |
| 44406.75 | 34.22 |
| 44406.760416666664 | 26.66 |
| 44406.770833333336 | 28.98 |
| 44406.78125 | 31.21 |
| 44406.791666666664 | 30.46 |
| 44406.802083333336 | 28.21 |
| 44406.8125 | 28.2 |
| 44406.822916666664 | 24.61 |
| 44406.833333333336 | 23.65 |
| 44406.84375 | 22.87 |
| 44406.854166666664 | 22.2 |
| 44406.864583333336 | 22.16 |
| 44406.875 | 26.38 |
| 44406.885416666664 | 27.75 |
| 44406.895833333336 | 28.98 |
| 44406.90625 | 29.34 |
| 44406.916666666664 | 27.93 |
| 44406.927083333336 | 26.94 |
| 44406.9375 | 25.41 |
| 44406.947916666664 | 26.35 |
| 44406.958333333336 | 24.24 |
| 44406.96875 | 25.99 |
| 44406.979166666664 | 25.76 |
| 44406.989583333336 | 24.55 |
| 44407.0 | 22.35 |
| 44407.010416666664 | 21.84 |
| 44407.020833333336 | 22.66 |
| 44407.03125 | 21.25 |
| 44407.041666666664 | 20.52 |
| 44407.052083333336 | 19.32 |
| 44407.0625 | 17.93 |
| 44407.072916666664 | 20.53 |
| 44407.083333333336 | 21.39 |
| 44407.09375 | 20.66 |
| 44407.104166666664 | 19.54 |
| 44407.114583333336 | 21.85 |
| 44407.125 | 21.36 |
| 44407.135416666664 | 24.79 |
| 44407.145833333336 | 25.54 |
| 44407.15625 | 28.48 |
| 44407.166666666664 | 27.62 |
| 44407.177083333336 | 30.74 |
| 44407.1875 | 31.1 |
| 44407.197916666664 | 31.01 |
| 44407.208333333336 | 33.13 |
| 44407.21875 | 32.76 |
| 44407.229166666664 | 31.68 |
| 44407.239583333336 | 31.07 |
| 44407.25 | 29.51 |
| 44407.260416666664 | 22.9 |
| 44407.270833333336 | 23.34 |
| 44407.28125 | 22.54 |
| 44407.291666666664 | 22.45 |
| 44407.302083333336 | 20.85 |
| 44407.3125 | 19.33 |
| 44407.322916666664 | 21.16 |
| 44407.333333333336 | 18.94 |
| 44407.34375 | 16.05 |
| 44407.354166666664 | 17.58 |
| 44407.364583333336 | 16 |
| 44407.375 | 15.55 |
| 44407.385416666664 | 17.1 |
| 44407.395833333336 | 16.32 |
| 44407.40625 | 19.49 |
| 44407.416666666664 | 18.53 |
| 44407.427083333336 | 16.17 |
| 44407.4375 | 15.72 |
| 44407.447916666664 | 15.84 |
| 44407.458333333336 | 16.39 |
| 44407.46875 | 16.22 |
| 44407.479166666664 | 17.09 |
| 44407.489583333336 | 18.47 |
| 44407.5 | 18.11 |
| 44407.510416666664 | 19.92 |
| 44407.520833333336 | 18.24 |
| 44407.53125 | 16.76 |
| 44407.541666666664 | 15.62 |
| 44407.552083333336 | 16.49 |
| 44407.5625 | 14.99 |
| 44407.572916666664 | 15.3 |
| 44407.583333333336 | 16.2 |
| 44407.59375 | 17.15 |
| 44407.604166666664 | 18.24 |
| 44407.614583333336 | 19.15 |
| 44407.625 | 23.48 |
| 44407.635416666664 | 22.81 |
| 44407.645833333336 | 21.03 |
| 44407.65625 | 26.19 |
| 44407.666666666664 | 30.29 |
| 44407.677083333336 | 28.81 |
| 44407.6875 | 31.27 |
| 44407.697916666664 | 32.31 |
| 44407.708333333336 | 34.56 |
| 44407.71875 | 30.71 |
| 44407.729166666664 | 30.82 |
| 44407.739583333336 | 31.82 |
| 44407.75 | 31.47 |
| 44407.760416666664 | 29.54 |
| 44407.770833333336 | 46.18 |
| 44407.78125 | 48.49 |
| 44407.791666666664 | 31.88 |
| 44407.802083333336 | 41.89 |
| 44407.8125 | 40.64 |
| 44407.822916666664 | 38.03 |
| 44407.833333333336 | 36.11 |
| 44407.84375 | 39.17 |
| 44407.854166666664 | 39.5 |
| 44407.864583333336 | 34.45 |
| 44407.875 | 31.12 |
| 44407.885416666664 | 34.9 |
| 44407.895833333336 | 29.41 |
| 44407.90625 | 28.48 |
| 44407.916666666664 | 34.67 |
| 44407.927083333336 | 32.45 |
| 44407.9375 | 30.51 |
| 44407.947916666664 | 30.31 |
| 44407.958333333336 | 28.42 |
| 44407.96875 | 29.32 |
| 44407.979166666664 | 26.95 |
| 44407.989583333336 | 27.82 |
| 44408.0 | 26.78 |
| 44408.010416666664 | 28.22 |
| 44408.020833333336 | 29.5 |
| 44408.03125 | 29.5 |
| 44408.041666666664 | 28.33 |
| 44408.052083333336 | 23.89 |
| 44408.0625 | 22.43 |
| 44408.072916666664 | 22.99 |
| 44408.083333333336 | 22.4 |
| 44408.09375 | 22.81 |
| 44408.104166666664 | 22.44 |
| 44408.114583333336 | 22.46 |
| 44408.125 | 20.11 |
| 44408.135416666664 | 20.36 |
| 44408.145833333336 | 20.26 |
| 44408.15625 | 18.58 |